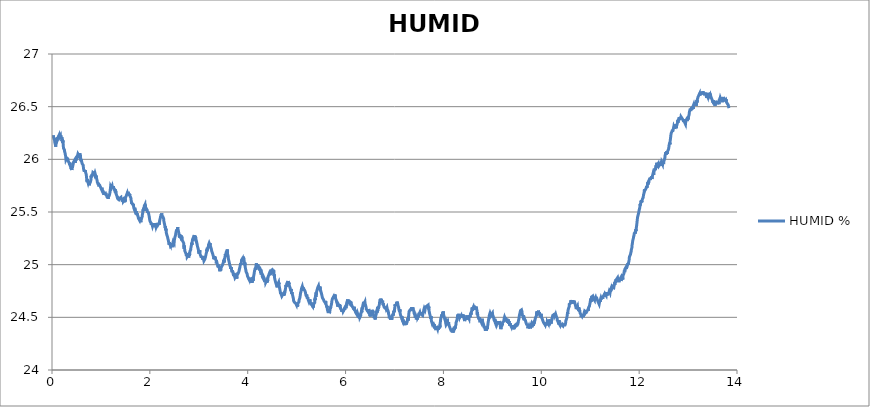
| Category | HUMID % |
|---|---|
| 0.01620481575 | 26.204 |
| 0.019264157416666667 | 26.204 |
| 0.022323499055555557 | 26.211 |
| 0.025382562916666667 | 26.211 |
| 0.028442737944444445 | 26.227 |
| 0.03150207961111111 | 26.211 |
| 0.03456142125 | 26.204 |
| 0.03762076291666666 | 26.204 |
| 0.040680104555555555 | 26.204 |
| 0.04373944622222222 | 26.204 |
| 0.04679878786111111 | 26.188 |
| 0.04985785172222222 | 26.204 |
| 0.05291747116666667 | 26.196 |
| 0.055977090611111106 | 26.173 |
| 0.05903643225 | 26.158 |
| 0.062096329500000005 | 26.158 |
| 0.0651553933611111 | 26.158 |
| 0.0682155683888889 | 26.158 |
| 0.07127546561111112 | 26.135 |
| 0.07433452947222222 | 26.12 |
| 0.07739387113888889 | 26.135 |
| 0.08045349058333334 | 26.135 |
| 0.08351283222222222 | 26.143 |
| 0.0865721738888889 | 26.15 |
| 0.08963123775 | 26.158 |
| 0.09269085719444445 | 26.15 |
| 0.09575019883333334 | 26.166 |
| 0.09880926269444444 | 26.158 |
| 0.10186999330555556 | 26.181 |
| 0.10492933497222222 | 26.181 |
| 0.10798839880555555 | 26.188 |
| 0.11104774047222221 | 26.181 |
| 0.11410735991666666 | 26.196 |
| 0.11716781274999999 | 26.211 |
| 0.12022715438888888 | 26.204 |
| 0.12328677383333334 | 26.196 |
| 0.12634611547222221 | 26.211 |
| 0.12940545713888887 | 26.204 |
| 0.132464521 | 26.204 |
| 0.13552441822222222 | 26.204 |
| 0.13858375988888888 | 26.211 |
| 0.1416431015277778 | 26.227 |
| 0.14470244319444445 | 26.211 |
| 0.14776178483333335 | 26.211 |
| 0.15082112649999999 | 26.227 |
| 0.15388157930555554 | 26.211 |
| 0.15694064316666667 | 26.219 |
| 0.15999998483333333 | 26.211 |
| 0.1630604376388889 | 26.204 |
| 0.16611977930555558 | 26.204 |
| 0.16917884316666668 | 26.219 |
| 0.17223790700000002 | 26.227 |
| 0.17529752644444443 | 26.211 |
| 0.1783568681111111 | 26.227 |
| 0.18141593197222222 | 26.227 |
| 0.18447527361111113 | 26.211 |
| 0.18753461527777776 | 26.211 |
| 0.1905936791111111 | 26.211 |
| 0.19365274297222224 | 26.204 |
| 0.19671264022222223 | 26.196 |
| 0.19977198186111111 | 26.211 |
| 0.20283104572222224 | 26.211 |
| 0.20589010958333334 | 26.173 |
| 0.20894945125 | 26.188 |
| 0.21200934847222222 | 26.181 |
| 0.21506924572222222 | 26.181 |
| 0.21812969852777778 | 26.158 |
| 0.22118904019444444 | 26.181 |
| 0.22424865963888888 | 26.166 |
| 0.22730800127777778 | 26.15 |
| 0.23036706513888888 | 26.127 |
| 0.23342696238888888 | 26.127 |
| 0.2364863040277778 | 26.104 |
| 0.2395453678888889 | 26.104 |
| 0.24260498733333333 | 26.097 |
| 0.2456643289722222 | 26.097 |
| 0.2487236706388889 | 26.097 |
| 0.2517830122777778 | 26.104 |
| 0.2548429095277778 | 26.089 |
| 0.25790225116666665 | 26.074 |
| 0.2609618706111111 | 26.074 |
| 0.2640209344722222 | 26.074 |
| 0.2670802761388889 | 26.059 |
| 0.27013934 | 26.059 |
| 0.2731992372222222 | 26.043 |
| 0.2762583010833333 | 26.043 |
| 0.27931792052777776 | 26.028 |
| 0.2823772621666667 | 26.013 |
| 0.2854374372222222 | 25.998 |
| 0.2884970566666667 | 26.005 |
| 0.2915566761111111 | 26.005 |
| 0.29461657333333335 | 25.998 |
| 0.2976756371944444 | 25.998 |
| 0.30073497883333333 | 26.013 |
| 0.3037940426944445 | 26.005 |
| 0.3068533843611111 | 26.013 |
| 0.309912726 | 26.005 |
| 0.31297429 | 26.005 |
| 0.31604002091666666 | 26.013 |
| 0.3190996403611111 | 26.005 |
| 0.3221592598055556 | 26.005 |
| 0.32521887925 | 25.998 |
| 0.3282796098611111 | 25.99 |
| 0.3313403404722222 | 25.99 |
| 0.33440023772222227 | 25.998 |
| 0.3374601349722222 | 25.998 |
| 0.34052086558333333 | 25.975 |
| 0.34358131841666667 | 25.982 |
| 0.3466417712222222 | 25.975 |
| 0.3497011128888889 | 25.967 |
| 0.3527632324722222 | 25.967 |
| 0.3558228519166667 | 25.967 |
| 0.35888330475 | 25.96 |
| 0.36194570211111116 | 25.944 |
| 0.36501421097222225 | 25.967 |
| 0.36807605275 | 25.96 |
| 0.37114261705555557 | 25.952 |
| 0.3742025142777778 | 25.937 |
| 0.3772626893055555 | 25.937 |
| 0.38032453111111114 | 25.937 |
| 0.3833844283333333 | 25.929 |
| 0.38644543675 | 25.921 |
| 0.38950700075 | 25.914 |
| 0.3925688425555556 | 25.906 |
| 0.39562985097222225 | 25.921 |
| 0.3986961374722222 | 25.921 |
| 0.40175603469444443 | 25.914 |
| 0.40481593194444443 | 25.898 |
| 0.4078777737222222 | 25.914 |
| 0.41093878213888885 | 25.914 |
| 0.4139986793888889 | 25.937 |
| 0.41705913219444446 | 25.921 |
| 0.42011875163888884 | 25.929 |
| 0.42317809330555556 | 25.937 |
| 0.42623743494444444 | 25.944 |
| 0.4292970543888889 | 25.944 |
| 0.4323566738333333 | 25.929 |
| 0.43541712666666665 | 25.96 |
| 0.43847674611111115 | 25.96 |
| 0.4415388656944444 | 25.975 |
| 0.4445984851388889 | 25.967 |
| 0.44765782680555555 | 25.967 |
| 0.4507188352222222 | 25.975 |
| 0.45378539949999996 | 25.975 |
| 0.4568447411388889 | 25.975 |
| 0.4599040828055555 | 25.99 |
| 0.46296370225 | 25.967 |
| 0.46602415505555556 | 25.982 |
| 0.4690837745 | 25.982 |
| 0.4721433939722222 | 25.975 |
| 0.4752024578055556 | 25.967 |
| 0.4782617994722222 | 25.982 |
| 0.48132225230555553 | 25.982 |
| 0.48438187175 | 25.975 |
| 0.48744093558333335 | 26.005 |
| 0.4905005550277778 | 25.99 |
| 0.49355989669444444 | 25.998 |
| 0.49661896055555554 | 25.998 |
| 0.4996791355833333 | 26.013 |
| 0.5027387550277778 | 25.998 |
| 0.5057980966666666 | 26.013 |
| 0.5088577161111111 | 26.013 |
| 0.5119170577777777 | 26.028 |
| 0.5149763994166666 | 26.013 |
| 0.5180357410833333 | 26.028 |
| 0.5210950827222223 | 26.028 |
| 0.5241549799722222 | 26.028 |
| 0.5272143216111111 | 26.028 |
| 0.5302736632777778 | 26.051 |
| 0.5333330049166667 | 26.051 |
| 0.5363920687777778 | 26.059 |
| 0.5394514104166667 | 26.059 |
| 0.5425110298611111 | 26.059 |
| 0.5455706493055555 | 26.059 |
| 0.5486299909722222 | 26.036 |
| 0.5516904437777778 | 26.036 |
| 0.5547497854444444 | 26.059 |
| 0.5578096826666666 | 26.043 |
| 0.5608693021111111 | 26.043 |
| 0.5639291993611111 | 26.043 |
| 0.5669888188055555 | 26.036 |
| 0.5700489938333333 | 26.036 |
| 0.5731083355 | 26.036 |
| 0.5761676771388888 | 26.051 |
| 0.5792275743888889 | 26.043 |
| 0.5822869160277778 | 26.036 |
| 0.5853487578333333 | 26.013 |
| 0.5884086550555556 | 26.013 |
| 0.5914679967222223 | 26.005 |
| 0.5945273383611112 | 25.982 |
| 0.5975869578055555 | 25.998 |
| 0.60064657725 | 25.99 |
| 0.6037061966944445 | 25.982 |
| 0.6067652605555556 | 25.975 |
| 0.60982488 | 25.99 |
| 0.6128842216388889 | 25.975 |
| 0.6159438410833333 | 25.96 |
| 0.6190029049444444 | 25.967 |
| 0.6220628021944444 | 25.967 |
| 0.6251221438333333 | 25.967 |
| 0.6281820410833333 | 25.967 |
| 0.6312411049444444 | 25.96 |
| 0.634300724388889 | 25.967 |
| 0.6373608994166666 | 25.944 |
| 0.6404199632777777 | 25.937 |
| 0.6434793049166666 | 25.914 |
| 0.6465386465833333 | 25.906 |
| 0.6495990993888889 | 25.898 |
| 0.6526584410555555 | 25.906 |
| 0.6557175049166666 | 25.898 |
| 0.6587768465555556 | 25.906 |
| 0.6618359104166667 | 25.883 |
| 0.6648949742777778 | 25.898 |
| 0.6679545937222223 | 25.891 |
| 0.6710139353611111 | 25.883 |
| 0.6740732770277779 | 25.883 |
| 0.6771323408888889 | 25.883 |
| 0.6801922381111111 | 25.898 |
| 0.6832515797777777 | 25.883 |
| 0.6863109214166666 | 25.883 |
| 0.6893699852777778 | 25.876 |
| 0.6924296047222221 | 25.868 |
| 0.6954892241666667 | 25.868 |
| 0.6985499547777778 | 25.876 |
| 0.7016106854166666 | 25.853 |
| 0.7046700270555555 | 25.83 |
| 0.7077302020833333 | 25.837 |
| 0.7107903771111111 | 25.815 |
| 0.7138497187777778 | 25.807 |
| 0.7169090604166667 | 25.792 |
| 0.7199684020833333 | 25.807 |
| 0.7230277437222222 | 25.784 |
| 0.7260868075833333 | 25.807 |
| 0.7291461492222222 | 25.792 |
| 0.7322060464722222 | 25.792 |
| 0.7352651103333334 | 25.792 |
| 0.7383244519722223 | 25.776 |
| 0.741383793638889 | 25.769 |
| 0.7444439686666667 | 25.784 |
| 0.7475030325277777 | 25.792 |
| 0.7505623741666667 | 25.784 |
| 0.7536222714166667 | 25.784 |
| 0.756681890861111 | 25.769 |
| 0.7597412324999999 | 25.769 |
| 0.7628005741666666 | 25.754 |
| 0.765859638 | 25.754 |
| 0.7689189796666668 | 25.769 |
| 0.7719780435277778 | 25.776 |
| 0.7750371073888889 | 25.769 |
| 0.7780964490277777 | 25.761 |
| 0.7811560684722223 | 25.776 |
| 0.7842151323333333 | 25.784 |
| 0.7872805854444445 | 25.792 |
| 0.7903402048888889 | 25.784 |
| 0.7934001021111111 | 25.792 |
| 0.7964627773055555 | 25.807 |
| 0.7995229523333333 | 25.845 |
| 0.8025836829444445 | 25.837 |
| 0.8056483026944444 | 25.83 |
| 0.8087073665277777 | 25.83 |
| 0.8117678193611111 | 25.837 |
| 0.8148282721944444 | 25.845 |
| 0.8179112263055556 | 25.837 |
| 0.8210047365833334 | 25.86 |
| 0.8240715786666667 | 25.845 |
| 0.8271378651388889 | 25.853 |
| 0.8302341533611111 | 25.86 |
| 0.8332948839722222 | 25.853 |
| 0.8363586703333333 | 25.876 |
| 0.8394296793055556 | 25.868 |
| 0.8424995771111111 | 25.876 |
| 0.8455630856666667 | 25.876 |
| 0.8486377059722222 | 25.868 |
| 0.8517070481944444 | 25.876 |
| 0.8547772238055555 | 25.876 |
| 0.8578462882222223 | 25.868 |
| 0.8609147970833333 | 25.876 |
| 0.8639855282777777 | 25.86 |
| 0.8670629264999999 | 25.868 |
| 0.8701283796111111 | 25.853 |
| 0.8731957772777778 | 25.86 |
| 0.8762559523055555 | 25.86 |
| 0.8793405731944444 | 25.868 |
| 0.882412971138889 | 25.868 |
| 0.8854831467500001 | 25.86 |
| 0.888550266611111 | 25.853 |
| 0.8916207200277778 | 25.86 |
| 0.89468533975 | 25.86 |
| 0.8977502372777778 | 25.83 |
| 0.9008168015555555 | 25.845 |
| 0.9038803101111111 | 25.845 |
| 0.9069743759722222 | 25.83 |
| 0.9100401068888888 | 25.837 |
| 0.9131016708888888 | 25.815 |
| 0.9161707353055556 | 25.807 |
| 0.9192364662222222 | 25.815 |
| 0.9223096975555556 | 25.799 |
| 0.9253823733055555 | 25.784 |
| 0.92844671525 | 25.776 |
| 0.9315141129166666 | 25.792 |
| 0.9346031784722223 | 25.784 |
| 0.93768391025 | 25.784 |
| 0.9407485299722222 | 25.784 |
| 0.9438209279166666 | 25.784 |
| 0.9468924925 | 25.761 |
| 0.9499568344444445 | 25.776 |
| 0.9530231209166666 | 25.754 |
| 0.9560907963888889 | 25.761 |
| 0.9591590274444444 | 25.754 |
| 0.9622339255277779 | 25.761 |
| 0.9653029899722223 | 25.754 |
| 0.9683670541111111 | 25.754 |
| 0.9714330628055556 | 25.754 |
| 0.9744946268055557 | 25.754 |
| 0.9775598021111112 | 25.754 |
| 0.9806277553888889 | 25.746 |
| 0.9836982087777778 | 25.746 |
| 0.9867617173333334 | 25.746 |
| 0.9898296705833333 | 25.738 |
| 0.9929040130833333 | 25.731 |
| 0.9959686328333333 | 25.738 |
| 0.9990457532777778 | 25.731 |
| 1.0021114841666665 | 25.738 |
| 1.0051797152222222 | 25.738 |
| 1.0082732255 | 25.731 |
| 1.0113453456666666 | 25.715 |
| 1.0144141323055555 | 25.715 |
| 1.017506531388889 | 25.715 |
| 1.0205739290555556 | 25.731 |
| 1.0236579943333333 | 25.715 |
| 1.02672372525 | 25.715 |
| 1.029811401861111 | 25.715 |
| 1.032892967 | 25.708 |
| 1.0359750877222222 | 25.708 |
| 1.0390497080277779 | 25.715 |
| 1.0421309953888889 | 25.7 |
| 1.0452078380277778 | 25.708 |
| 1.0482696798333333 | 25.692 |
| 1.0513426333611111 | 25.685 |
| 1.0544441996666667 | 25.685 |
| 1.05753659875 | 25.677 |
| 1.0606017740833333 | 25.662 |
| 1.0636813946666666 | 25.662 |
| 1.0667543481944444 | 25.67 |
| 1.0698203569166667 | 25.677 |
| 1.072900810861111 | 25.677 |
| 1.0759909876111111 | 25.685 |
| 1.079068385861111 | 25.677 |
| 1.0821452285 | 25.692 |
| 1.0852242935 | 25.685 |
| 1.0883314156666666 | 25.662 |
| 1.0913993689166668 | 25.677 |
| 1.0944737114444445 | 25.662 |
| 1.0975466649722223 | 25.677 |
| 1.1006465645 | 25.67 |
| 1.1037395191944444 | 25.67 |
| 1.1068299737222222 | 25.677 |
| 1.1099054274166666 | 25.662 |
| 1.1130056047222223 | 25.67 |
| 1.1160841141388889 | 25.662 |
| 1.1191570676944445 | 25.654 |
| 1.1222719680833333 | 25.647 |
| 1.1253426992777777 | 25.654 |
| 1.1284198197222222 | 25.647 |
| 1.1314986069166666 | 25.647 |
| 1.1345998954166667 | 25.639 |
| 1.1376775714444445 | 25.647 |
| 1.1407677481944445 | 25.647 |
| 1.143864592 | 25.647 |
| 1.1469633803333332 | 25.624 |
| 1.150034667111111 | 25.639 |
| 1.1530981756666667 | 25.639 |
| 1.1561677956944443 | 25.639 |
| 1.1592404714444446 | 25.631 |
| 1.1623070357222223 | 25.631 |
| 1.1653749889722222 | 25.647 |
| 1.1684454423888888 | 25.654 |
| 1.17151728475 | 25.662 |
| 1.1745807933055554 | 25.662 |
| 1.1776495799444446 | 25.67 |
| 1.1807283671388888 | 25.662 |
| 1.183796876 | 25.685 |
| 1.1868745520277777 | 25.692 |
| 1.1899419496944446 | 25.708 |
| 1.1930087917777779 | 25.7 |
| 1.1960803563333333 | 25.731 |
| 1.199141086972222 | 25.746 |
| 1.2022040399166667 | 25.738 |
| 1.2052689374444445 | 25.738 |
| 1.2083402242222223 | 25.738 |
| 1.2114126221944443 | 25.738 |
| 1.2144758529444446 | 25.738 |
| 1.2175410282777777 | 25.731 |
| 1.2206195376666666 | 25.731 |
| 1.2236849907777776 | 25.738 |
| 1.226747110388889 | 25.738 |
| 1.2298114523055557 | 25.746 |
| 1.2328738496944445 | 25.746 |
| 1.2359351359166666 | 25.731 |
| 1.2390130897222222 | 25.746 |
| 1.2420793762222222 | 25.738 |
| 1.2451409402222222 | 25.731 |
| 1.2482086156944443 | 25.746 |
| 1.25127212425 | 25.731 |
| 1.2543372995555557 | 25.746 |
| 1.2574005303333333 | 25.731 |
| 1.2604654278333334 | 25.738 |
| 1.2635375480000002 | 25.731 |
| 1.2666024455277778 | 25.738 |
| 1.2696676208333333 | 25.723 |
| 1.2727280736666666 | 25.738 |
| 1.27579491575 | 25.723 |
| 1.2788553685833333 | 25.715 |
| 1.2819174881666666 | 25.708 |
| 1.2849804411388888 | 25.723 |
| 1.2880447830833333 | 25.7 |
| 1.2911080138333333 | 25.715 |
| 1.2941693000277776 | 25.685 |
| 1.297237808888889 | 25.685 |
| 1.3002988173055554 | 25.677 |
| 1.3033606590833333 | 25.7 |
| 1.3064227786666667 | 25.677 |
| 1.3094862872222222 | 25.67 |
| 1.3125764639722222 | 25.67 |
| 1.315646917388889 | 25.67 |
| 1.3187112593055557 | 25.662 |
| 1.3217733789166666 | 25.654 |
| 1.3248496659722224 | 25.654 |
| 1.3279128967222222 | 25.654 |
| 1.3309814055833333 | 25.647 |
| 1.334059081611111 | 25.654 |
| 1.3371187010555556 | 25.631 |
| 1.34018470975 | 25.647 |
| 1.34324627375 | 25.647 |
| 1.3463556182499998 | 25.624 |
| 1.3494169044722222 | 25.631 |
| 1.3524768016944444 | 25.631 |
| 1.35555447775 | 25.616 |
| 1.358627986861111 | 25.624 |
| 1.3617020515833331 | 25.624 |
| 1.3647708382222221 | 25.616 |
| 1.3678396248611113 | 25.616 |
| 1.370907578111111 | 25.624 |
| 1.373972475638889 | 25.624 |
| 1.3770398733055558 | 25.624 |
| 1.38009949275 | 25.609 |
| 1.3831646680555556 | 25.616 |
| 1.3862278988333332 | 25.631 |
| 1.3892891850277778 | 25.631 |
| 1.392348804472222 | 25.624 |
| 1.395409812888889 | 25.631 |
| 1.39852137975 | 25.624 |
| 1.4015904441666667 | 25.624 |
| 1.4046672868333334 | 25.639 |
| 1.4077335733333334 | 25.639 |
| 1.4108006931944443 | 25.631 |
| 1.41386420175 | 25.616 |
| 1.4169260435555555 | 25.609 |
| 1.419986496361111 | 25.624 |
| 1.4230477825833332 | 25.631 |
| 1.4261240696388888 | 25.624 |
| 1.4291925784722221 | 25.616 |
| 1.432258864972222 | 25.624 |
| 1.4353254292777777 | 25.624 |
| 1.4383958826666667 | 25.616 |
| 1.4414757810555556 | 25.624 |
| 1.4445415119444445 | 25.624 |
| 1.447609743 | 25.624 |
| 1.450673807138889 | 25.624 |
| 1.4537331488055556 | 25.616 |
| 1.4567994352777778 | 25.601 |
| 1.45986238825 | 25.609 |
| 1.462932008277778 | 25.609 |
| 1.4659946834444446 | 25.609 |
| 1.4690679147777779 | 25.601 |
| 1.4721311455555555 | 25.609 |
| 1.4751918761666667 | 25.609 |
| 1.4782526067777777 | 25.616 |
| 1.4813763965555555 | 25.601 |
| 1.4844396273333333 | 25.616 |
| 1.4875009135277777 | 25.593 |
| 1.4905641443055555 | 25.616 |
| 1.4936376534166667 | 25.601 |
| 1.4967033843333333 | 25.609 |
| 1.499776337861111 | 25.631 |
| 1.5028492914166665 | 25.639 |
| 1.505911411 | 25.631 |
| 1.5089813088055555 | 25.639 |
| 1.5120500954444445 | 25.647 |
| 1.5151147151666666 | 25.647 |
| 1.51817683475 | 25.647 |
| 1.5212372875833333 | 25.654 |
| 1.5242988515833333 | 25.662 |
| 1.5273584710277777 | 25.67 |
| 1.5304194794444446 | 25.654 |
| 1.5334807656388887 | 25.662 |
| 1.5365401073055556 | 25.677 |
| 1.5396027824722223 | 25.677 |
| 1.5426624019166666 | 25.662 |
| 1.5457264660555554 | 25.677 |
| 1.5487919191666666 | 25.685 |
| 1.5518590390555556 | 25.685 |
| 1.5549247699444444 | 25.692 |
| 1.5579846671944446 | 25.677 |
| 1.5610467867777778 | 25.67 |
| 1.5641205736944443 | 25.685 |
| 1.5671824155 | 25.685 |
| 1.5702423127222223 | 25.685 |
| 1.5733049879166667 | 25.67 |
| 1.5763643295555554 | 25.677 |
| 1.5794250601666666 | 25.67 |
| 1.5824849574166668 | 25.654 |
| 1.5855451324444445 | 25.662 |
| 1.588609474388889 | 25.67 |
| 1.5916727051388888 | 25.654 |
| 1.5947353803333333 | 25.662 |
| 1.5977974999166669 | 25.654 |
| 1.6008579527500002 | 25.647 |
| 1.6039203501111112 | 25.654 |
| 1.6069816363333334 | 25.662 |
| 1.610041811361111 | 25.647 |
| 1.6131008752222222 | 25.631 |
| 1.616163550388889 | 25.616 |
| 1.6192253921944444 | 25.616 |
| 1.6222955677777777 | 25.601 |
| 1.6253549094444444 | 25.586 |
| 1.6284303631111112 | 25.593 |
| 1.6314899825555556 | 25.593 |
| 1.6345507131944443 | 25.578 |
| 1.6376106104166666 | 25.578 |
| 1.6406707854444444 | 25.578 |
| 1.643730127111111 | 25.586 |
| 1.6467903021388888 | 25.578 |
| 1.6498529773055555 | 25.57 |
| 1.6529128745555555 | 25.563 |
| 1.6559774942777776 | 25.57 |
| 1.65904044725 | 25.57 |
| 1.6621000666944443 | 25.578 |
| 1.6651688533333333 | 25.563 |
| 1.6682365288055556 | 25.563 |
| 1.6713150382222224 | 25.54 |
| 1.6743749354444446 | 25.532 |
| 1.6774356660555554 | 25.54 |
| 1.6804950077222223 | 25.532 |
| 1.6835546271666666 | 25.525 |
| 1.6866184135 | 25.525 |
| 1.6896847 | 25.54 |
| 1.69274459725 | 25.54 |
| 1.6958050500555555 | 25.532 |
| 1.6988666140555557 | 25.54 |
| 1.7019287336666666 | 25.532 |
| 1.7049889086944445 | 25.509 |
| 1.7080493615277779 | 25.509 |
| 1.7111089809722222 | 25.502 |
| 1.714177212 | 25.502 |
| 1.7172376648333334 | 25.502 |
| 1.7202972842777777 | 25.487 |
| 1.723358570472222 | 25.509 |
| 1.7264223568333334 | 25.487 |
| 1.7294839208333332 | 25.494 |
| 1.7325443736666666 | 25.479 |
| 1.7356037153055557 | 25.471 |
| 1.7386691684166666 | 25.479 |
| 1.7417326769722223 | 25.487 |
| 1.7447934076111111 | 25.487 |
| 1.7478541382222224 | 25.471 |
| 1.75091431325 | 25.471 |
| 1.7539739326944443 | 25.471 |
| 1.757035218888889 | 25.464 |
| 1.7600948383333332 | 25.456 |
| 1.763155013388889 | 25.456 |
| 1.766217132972222 | 25.441 |
| 1.7692825860833332 | 25.448 |
| 1.7723613732777777 | 25.441 |
| 1.7754207149444445 | 25.448 |
| 1.7784833901111112 | 25.448 |
| 1.78154745425 | 25.448 |
| 1.7846098516388889 | 25.425 |
| 1.7876769715 | 25.433 |
| 1.7907413134444445 | 25.448 |
| 1.7938050998055557 | 25.433 |
| 1.7968841648055556 | 25.441 |
| 1.7999443398333335 | 25.433 |
| 1.8030042370555557 | 25.441 |
| 1.8060644121111111 | 25.433 |
| 1.8091287540277778 | 25.425 |
| 1.8122169862222222 | 25.425 |
| 1.815276327888889 | 25.403 |
| 1.8183365029166667 | 25.418 |
| 1.82139695575 | 25.425 |
| 1.8244587975277777 | 25.425 |
| 1.8275203615277777 | 25.433 |
| 1.8305805365555554 | 25.433 |
| 1.8336418227777778 | 25.433 |
| 1.8367042201388888 | 25.433 |
| 1.8397696732500002 | 25.441 |
| 1.8428331818055554 | 25.456 |
| 1.8458947458055557 | 25.471 |
| 1.8489554764444445 | 25.471 |
| 1.8520273188055556 | 25.479 |
| 1.855118884527778 | 25.494 |
| 1.8581798929444444 | 25.502 |
| 1.861240067972222 | 25.525 |
| 1.8643007985833333 | 25.525 |
| 1.8673623625833333 | 25.509 |
| 1.8704247599722224 | 25.525 |
| 1.8734918798333333 | 25.54 |
| 1.8765512215 | 25.517 |
| 1.879620008138889 | 25.532 |
| 1.8826857390277778 | 25.54 |
| 1.8857459140555557 | 25.555 |
| 1.888810256 | 25.563 |
| 1.8918704310277779 | 25.548 |
| 1.894933384 | 25.555 |
| 1.898012449 | 25.555 |
| 1.901074846388889 | 25.57 |
| 1.9041358548055556 | 25.555 |
| 1.9071982521666668 | 25.57 |
| 1.9102603717777777 | 25.555 |
| 1.913319991222222 | 25.555 |
| 1.9163879444722223 | 25.548 |
| 1.9194481195000002 | 25.532 |
| 1.92250801675 | 25.509 |
| 1.9255712475 | 25.532 |
| 1.9286333670833333 | 25.532 |
| 1.9316988201944443 | 25.525 |
| 1.934759828611111 | 25.525 |
| 1.937819725861111 | 25.532 |
| 1.9408860123333334 | 25.525 |
| 1.9439459095833334 | 25.525 |
| 1.9470099737222222 | 25.517 |
| 1.9500743156666667 | 25.502 |
| 1.9531350462777777 | 25.502 |
| 1.956195776888889 | 25.509 |
| 1.9592559519444444 | 25.502 |
| 1.962317793722222 | 25.494 |
| 1.9653790799444444 | 25.502 |
| 1.9684392549722223 | 25.494 |
| 1.97149943 | 25.494 |
| 1.9745584938611112 | 25.494 |
| 1.9776236691666669 | 25.479 |
| 1.9806843997777777 | 25.471 |
| 1.9837442970277779 | 25.471 |
| 1.9868041942777779 | 25.456 |
| 1.9898732586944445 | 25.448 |
| 1.9929409341666666 | 25.441 |
| 1.9960005536111112 | 25.425 |
| 1.9990648955277779 | 25.425 |
| 2.002144516138889 | 25.425 |
| 2.0052060801388887 | 25.41 |
| 2.008267644138889 | 25.41 |
| 2.0113289303333333 | 25.41 |
| 2.0143893831666664 | 25.403 |
| 2.0174495581944445 | 25.41 |
| 2.0205094554444445 | 25.41 |
| 2.0235685192777777 | 25.395 |
| 2.0266411950277776 | 25.387 |
| 2.0297088705 | 25.38 |
| 2.0327690455277776 | 25.38 |
| 2.0358292205555557 | 25.395 |
| 2.0388941180833333 | 25.395 |
| 2.0419554043055554 | 25.395 |
| 2.0450155793333336 | 25.38 |
| 2.048078810083333 | 25.372 |
| 2.0511398185 | 25.372 |
| 2.0542008269166665 | 25.364 |
| 2.05726127975 | 25.372 |
| 2.0603245105 | 25.364 |
| 2.0633994085833334 | 25.372 |
| 2.066459028027778 | 25.372 |
| 2.069520869833333 | 25.387 |
| 2.0725807670833336 | 25.372 |
| 2.0756417755 | 25.38 |
| 2.0787013949444444 | 25.364 |
| 2.0817757374444446 | 25.38 |
| 2.084835079083333 | 25.387 |
| 2.0878991432222223 | 25.357 |
| 2.0909598738611113 | 25.38 |
| 2.0940203266666666 | 25.395 |
| 2.0970796683333335 | 25.364 |
| 2.1001448436388888 | 25.372 |
| 2.103211963527778 | 25.38 |
| 2.1062874171944443 | 25.372 |
| 2.1093475922500002 | 25.38 |
| 2.1124066560833334 | 25.38 |
| 2.1154671089166666 | 25.357 |
| 2.1185381179166667 | 25.349 |
| 2.121608849083333 | 25.372 |
| 2.124671246472222 | 25.364 |
| 2.1277330882777776 | 25.357 |
| 2.1308018749166666 | 25.357 |
| 2.133861494361111 | 25.357 |
| 2.1369241695277776 | 25.357 |
| 2.1399865669166664 | 25.372 |
| 2.1430464641388887 | 25.372 |
| 2.1461077503611112 | 25.38 |
| 2.1491698699444446 | 25.395 |
| 2.1522392121666667 | 25.38 |
| 2.1552988316111112 | 25.372 |
| 2.158363729138889 | 25.395 |
| 2.161423070777778 | 25.387 |
| 2.1644824124444444 | 25.403 |
| 2.1675417540833335 | 25.38 |
| 2.17060109575 | 25.38 |
| 2.1736640486944445 | 25.372 |
| 2.1767356132777778 | 25.38 |
| 2.1797946771388887 | 25.38 |
| 2.182861519222222 | 25.387 |
| 2.1859219720555556 | 25.395 |
| 2.1889868695555554 | 25.38 |
| 2.1920492669444442 | 25.38 |
| 2.1951108309444445 | 25.395 |
| 2.198171005972222 | 25.403 |
| 2.201230069833333 | 25.403 |
| 2.2042955229444443 | 25.425 |
| 2.2073562535555555 | 25.433 |
| 2.2104178175555553 | 25.433 |
| 2.213478270388889 | 25.433 |
| 2.216538167638889 | 25.448 |
| 2.219602231777778 | 25.448 |
| 2.222669351638889 | 25.448 |
| 2.2257311934444446 | 25.464 |
| 2.2287916462777777 | 25.448 |
| 2.2318604329166667 | 25.456 |
| 2.2349253304166665 | 25.479 |
| 2.237988283388889 | 25.464 |
| 2.2410590145833336 | 25.487 |
| 2.2441236343333335 | 25.464 |
| 2.2471874206666667 | 25.464 |
| 2.250250095833333 | 25.456 |
| 2.2533113820555557 | 25.464 |
| 2.2563935027777777 | 25.464 |
| 2.2594531222222223 | 25.464 |
| 2.262512741666667 | 25.456 |
| 2.2655765280277778 | 25.456 |
| 2.2686414255555554 | 25.464 |
| 2.2717021561666666 | 25.456 |
| 2.274765664722222 | 25.456 |
| 2.277826117555555 | 25.448 |
| 2.2808943485833333 | 25.456 |
| 2.2839534124444447 | 25.433 |
| 2.2870133096944443 | 25.41 |
| 2.2900918191111113 | 25.41 |
| 2.293151994138889 | 25.403 |
| 2.2962121691666666 | 25.418 |
| 2.299273733166667 | 25.418 |
| 2.3023350193888885 | 25.38 |
| 2.305397138972222 | 25.372 |
| 2.308457314 | 25.38 |
| 2.311521933722222 | 25.38 |
| 2.3145846088888886 | 25.349 |
| 2.3176467285 | 25.364 |
| 2.320706625722222 | 25.349 |
| 2.323765967388889 | 25.326 |
| 2.326838920916667 | 25.342 |
| 2.3299004849166667 | 25.342 |
| 2.3329812166944444 | 25.326 |
| 2.3360458364166665 | 25.303 |
| 2.339108789388889 | 25.311 |
| 2.3421681310277775 | 25.296 |
| 2.3452271948888885 | 25.296 |
| 2.348287647722222 | 25.281 |
| 2.3513536564166664 | 25.288 |
| 2.3544163315833333 | 25.288 |
| 2.3574792845555557 | 25.273 |
| 2.360538626222222 | 25.265 |
| 2.363599634611111 | 25.265 |
| 2.3666606430277777 | 25.25 |
| 2.369723318222222 | 25.25 |
| 2.372783215444444 | 25.25 |
| 2.3758425571111115 | 25.235 |
| 2.3789024543333337 | 25.227 |
| 2.381962073777778 | 25.219 |
| 2.385026137916667 | 25.219 |
| 2.3880935355833333 | 25.212 |
| 2.391153155027778 | 25.204 |
| 2.3942133300833333 | 25.189 |
| 2.3972735051111114 | 25.197 |
| 2.4003334023333336 | 25.212 |
| 2.4033963553055555 | 25.197 |
| 2.406459308277778 | 25.197 |
| 2.409520594472222 | 25.189 |
| 2.412581880694445 | 25.197 |
| 2.4156490005555558 | 25.189 |
| 2.4187138980833334 | 25.204 |
| 2.4217768510555557 | 25.181 |
| 2.4248398040277777 | 25.204 |
| 2.4279216469722225 | 25.174 |
| 2.4309871000833336 | 25.166 |
| 2.434053664361111 | 25.174 |
| 2.4371141171944446 | 25.174 |
| 2.4401745700277777 | 25.174 |
| 2.44323446725 | 25.174 |
| 2.4462965868333333 | 25.174 |
| 2.4493567618611114 | 25.181 |
| 2.452416659111111 | 25.174 |
| 2.455481556638889 | 25.174 |
| 2.4585458985833335 | 25.174 |
| 2.4616049624166667 | 25.166 |
| 2.464685138611111 | 25.197 |
| 2.467746424805555 | 25.204 |
| 2.4708088221944444 | 25.204 |
| 2.4738681638333335 | 25.204 |
| 2.47692917225 | 25.219 |
| 2.479991291833333 | 25.219 |
| 2.4830581339166664 | 25.227 |
| 2.486118031166667 | 25.212 |
| 2.4891829286944445 | 25.212 |
| 2.4922422703333336 | 25.219 |
| 2.4953018897777777 | 25.204 |
| 2.498364287166667 | 25.227 |
| 2.5014277957222224 | 25.235 |
| 2.5044874151666665 | 25.227 |
| 2.507558146361111 | 25.235 |
| 2.5106222105000002 | 25.258 |
| 2.5136826633333333 | 25.25 |
| 2.5167464496666665 | 25.258 |
| 2.519819125416667 | 25.258 |
| 2.5228793004444445 | 25.265 |
| 2.5259411422499998 | 25.265 |
| 2.529001872861111 | 25.288 |
| 2.5320639924444444 | 25.303 |
| 2.5351247230833334 | 25.311 |
| 2.5381907317777777 | 25.303 |
| 2.5412500734166668 | 25.296 |
| 2.5443135819722222 | 25.326 |
| 2.547373757 | 25.326 |
| 2.5504369877777777 | 25.334 |
| 2.5534979961944444 | 25.326 |
| 2.5565581712222225 | 25.326 |
| 2.559621679777778 | 25.319 |
| 2.5626835215833332 | 25.326 |
| 2.565745363361111 | 25.334 |
| 2.5688083163333335 | 25.357 |
| 2.5718687691666666 | 25.342 |
| 2.574928666388889 | 25.334 |
| 2.5779902303888886 | 25.334 |
| 2.581052627777778 | 25.326 |
| 2.584111969416667 | 25.326 |
| 2.587173255638889 | 25.311 |
| 2.5902350974166666 | 25.303 |
| 2.593294439083333 | 25.296 |
| 2.5963573920555554 | 25.303 |
| 2.5994175670833335 | 25.296 |
| 2.6024780199166666 | 25.296 |
| 2.6055404172777776 | 25.258 |
| 2.608600314527778 | 25.288 |
| 2.6116635452777777 | 25.265 |
| 2.6147309429444445 | 25.281 |
| 2.617792229166667 | 25.273 |
| 2.6208579600555555 | 25.273 |
| 2.6239242465555557 | 25.273 |
| 2.626987477333333 | 25.265 |
| 2.6300473745555553 | 25.273 |
| 2.633107827388889 | 25.273 |
| 2.636168002416667 | 25.281 |
| 2.6392351223055552 | 25.25 |
| 2.6422961306944446 | 25.265 |
| 2.6453663063055557 | 25.265 |
| 2.648430092666667 | 25.25 |
| 2.6514911010833333 | 25.265 |
| 2.6545554429999996 | 25.258 |
| 2.65761534025 | 25.235 |
| 2.660674404111111 | 25.242 |
| 2.6637370792777775 | 25.242 |
| 2.6667972543055556 | 25.227 |
| 2.6698574293333333 | 25.242 |
| 2.6729173265833333 | 25.227 |
| 2.6759813907222223 | 25.219 |
| 2.679042676944445 | 25.219 |
| 2.682102574166667 | 25.212 |
| 2.6851688606666664 | 25.212 |
| 2.6882357027499997 | 25.212 |
| 2.691296988944444 | 25.204 |
| 2.6943577195833335 | 25.181 |
| 2.6974228948888888 | 25.166 |
| 2.700486125638889 | 25.151 |
| 2.7035457450833333 | 25.181 |
| 2.7066075868888886 | 25.166 |
| 2.709669150888889 | 25.158 |
| 2.712737104138889 | 25.166 |
| 2.7157995015277776 | 25.128 |
| 2.7188591209722226 | 25.136 |
| 2.7219240184999998 | 25.136 |
| 2.7249933607222223 | 25.128 |
| 2.7280554803055557 | 25.12 |
| 2.7311178776944445 | 25.113 |
| 2.734183886388889 | 25.113 |
| 2.7372443392222223 | 25.113 |
| 2.7403114590833337 | 25.105 |
| 2.7433744120555557 | 25.097 |
| 2.746450699111111 | 25.082 |
| 2.7495136520833334 | 25.105 |
| 2.752575771666667 | 25.082 |
| 2.7556381690555556 | 25.105 |
| 2.7587025109999996 | 25.09 |
| 2.761772964388889 | 25.075 |
| 2.7648325838333334 | 25.067 |
| 2.767893314444444 | 25.075 |
| 2.7709537672777778 | 25.082 |
| 2.7740150535 | 25.075 |
| 2.7770788398333335 | 25.082 |
| 2.780139014861111 | 25.075 |
| 2.783202801222222 | 25.09 |
| 2.7862649208055554 | 25.082 |
| 2.78932454025 | 25.082 |
| 2.7923872154166665 | 25.067 |
| 2.795449057222222 | 25.082 |
| 2.7985172882777776 | 25.082 |
| 2.8015791300555555 | 25.082 |
| 2.804646805527778 | 25.097 |
| 2.8077069805555555 | 25.097 |
| 2.8107702113055555 | 25.082 |
| 2.8138301085555555 | 25.097 |
| 2.8168900058055555 | 25.105 |
| 2.8199532365555555 | 25.128 |
| 2.8230511915277776 | 25.128 |
| 2.826115533472222 | 25.128 |
| 2.8291754306944443 | 25.136 |
| 2.832235050138889 | 25.136 |
| 2.8352988365 | 25.143 |
| 2.838358178138889 | 25.158 |
| 2.8414211311111113 | 25.158 |
| 2.844484361888889 | 25.166 |
| 2.8475573154166662 | 25.181 |
| 2.8506191572222224 | 25.189 |
| 2.853681832388889 | 25.189 |
| 2.8567556193055554 | 25.204 |
| 2.859816627722222 | 25.189 |
| 2.862887358916667 | 25.212 |
| 2.865948089527778 | 25.204 |
| 2.869008542361111 | 25.219 |
| 2.872068717388889 | 25.212 |
| 2.875130836972222 | 25.242 |
| 2.878191012 | 25.227 |
| 2.8812550761666667 | 25.25 |
| 2.8843188625 | 25.242 |
| 2.88737875975 | 25.242 |
| 2.8904522688611114 | 25.258 |
| 2.893512166111111 | 25.258 |
| 2.896572896722222 | 25.265 |
| 2.899634738527778 | 25.273 |
| 2.9027035251666664 | 25.265 |
| 2.9057673115 | 25.273 |
| 2.908830820055556 | 25.281 |
| 2.9118982177222223 | 25.258 |
| 2.9149642264166666 | 25.265 |
| 2.918025790416667 | 25.258 |
| 2.9210898545833333 | 25.258 |
| 2.9241533631388887 | 25.265 |
| 2.927241873111111 | 25.242 |
| 2.930330383111111 | 25.25 |
| 2.933400003111111 | 25.273 |
| 2.936462122694444 | 25.258 |
| 2.9395225755277776 | 25.265 |
| 2.942585806305556 | 25.25 |
| 2.945646259111111 | 25.235 |
| 2.9487106010555553 | 25.242 |
| 2.951780498861111 | 25.235 |
| 2.9548423406666666 | 25.235 |
| 2.9579091827500004 | 25.212 |
| 2.9609715801111114 | 25.204 |
| 2.9640334219166666 | 25.204 |
| 2.967097208277778 | 25.189 |
| 2.9701565499166667 | 25.189 |
| 2.9732195028888886 | 25.174 |
| 2.976280789083333 | 25.181 |
| 2.979340964111111 | 25.166 |
| 2.9824114175277776 | 25.158 |
| 2.985472148138889 | 25.166 |
| 2.9885331565555555 | 25.151 |
| 2.9915936093888886 | 25.166 |
| 2.99465434 | 25.136 |
| 2.997715904 | 25.136 |
| 3.0007771901944444 | 25.12 |
| 3.0038390319999997 | 25.136 |
| 3.006912541138889 | 25.105 |
| 3.0099729939444444 | 25.136 |
| 3.01306511525 | 25.128 |
| 3.016126401472222 | 25.12 |
| 3.0191957436944445 | 25.136 |
| 3.022257029888889 | 25.12 |
| 3.0253180383055556 | 25.113 |
| 3.0283812690555556 | 25.097 |
| 3.0314714458055554 | 25.097 |
| 3.034538010111111 | 25.09 |
| 3.0375970739722225 | 25.09 |
| 3.0406589157500004 | 25.082 |
| 3.043722702111111 | 25.075 |
| 3.046788155222222 | 25.09 |
| 3.0498502748055554 | 25.082 |
| 3.0529096164444445 | 25.067 |
| 3.055970069277778 | 25.082 |
| 3.059034689 | 25.075 |
| 3.0620979197777776 | 25.067 |
| 3.065157539222222 | 25.082 |
| 3.0682213255555557 | 25.075 |
| 3.0712826117777774 | 25.067 |
| 3.0743425089999996 | 25.067 |
| 3.0774051841944443 | 25.067 |
| 3.080468970527778 | 25.052 |
| 3.0835285899722225 | 25.052 |
| 3.0865904317777777 | 25.067 |
| 3.0896522735833334 | 25.044 |
| 3.0927118930277775 | 25.052 |
| 3.095778457305556 | 25.075 |
| 3.09883807675 | 25.052 |
| 3.1019024186944444 | 25.052 |
| 3.1049631493055556 | 25.036 |
| 3.1080244355 | 25.044 |
| 3.111088499638889 | 25.044 |
| 3.1141970107777777 | 25.036 |
| 3.1172574636111112 | 25.044 |
| 3.1203256946666666 | 25.044 |
| 3.123385591888889 | 25.052 |
| 3.126452433972222 | 25.052 |
| 3.1295173315 | 25.052 |
| 3.1325872293055554 | 25.067 |
| 3.135647126555556 | 25.067 |
| 3.1387173021388888 | 25.075 |
| 3.1417769215833333 | 25.075 |
| 3.144836541027778 | 25.09 |
| 3.147896993861111 | 25.082 |
| 3.1509566133055555 | 25.105 |
| 3.1540203996666665 | 25.105 |
| 3.1570811302777777 | 25.105 |
| 3.160141305305556 | 25.12 |
| 3.1632059250555553 | 25.143 |
| 3.1662672112499997 | 25.128 |
| 3.1693387758333333 | 25.136 |
| 3.172400062027778 | 25.136 |
| 3.1754649595555557 | 25.158 |
| 3.1785262457499996 | 25.143 |
| 3.181586143 | 25.158 |
| 3.1846482625833334 | 25.166 |
| 3.1877081598333334 | 25.166 |
| 3.190768612638889 | 25.166 |
| 3.1938343435555554 | 25.166 |
| 3.196922020166667 | 25.174 |
| 3.1999835841666666 | 25.189 |
| 3.203043203611111 | 25.197 |
| 3.206103378638889 | 25.189 |
| 3.209166609388889 | 25.189 |
| 3.212227340027778 | 25.204 |
| 3.2152902930000002 | 25.204 |
| 3.218351857 | 25.212 |
| 3.221413143194445 | 25.197 |
| 3.224473318222222 | 25.189 |
| 3.2275326598888885 | 25.197 |
| 3.23059505725 | 25.204 |
| 3.233660510361111 | 25.189 |
| 3.2367234633333335 | 25.181 |
| 3.2397850273333333 | 25.174 |
| 3.2428479803055557 | 25.174 |
| 3.245908710916667 | 25.174 |
| 3.2489736084444445 | 25.174 |
| 3.2520390615555557 | 25.166 |
| 3.255098403222222 | 25.151 |
| 3.258159411638889 | 25.143 |
| 3.261224031361111 | 25.151 |
| 3.264283650805556 | 25.128 |
| 3.2673541041944443 | 25.136 |
| 3.2704156681944445 | 25.136 |
| 3.2734752876388886 | 25.136 |
| 3.2765354626666667 | 25.113 |
| 3.2796006380000002 | 25.113 |
| 3.2826627575833336 | 25.105 |
| 3.285725710555556 | 25.12 |
| 3.2887911636666662 | 25.105 |
| 3.2918505053055553 | 25.09 |
| 3.294910958138889 | 25.097 |
| 3.29797168875 | 25.082 |
| 3.3010338083333335 | 25.075 |
| 3.304093983388889 | 25.067 |
| 3.3071544361944447 | 25.075 |
| 3.310218222555555 | 25.052 |
| 3.313277842 | 25.067 |
| 3.3163369058611107 | 25.075 |
| 3.31940735925 | 25.075 |
| 3.3224708678055555 | 25.067 |
| 3.3255321540277776 | 25.082 |
| 3.32859205125 | 25.067 |
| 3.331660282305555 | 25.059 |
| 3.3347204573333333 | 25.052 |
| 3.3377842436944447 | 25.059 |
| 3.340844974305556 | 25.067 |
| 3.3439065383055553 | 25.052 |
| 3.3469675467222224 | 25.059 |
| 3.3500274439444446 | 25.059 |
| 3.353092063694444 | 25.052 |
| 3.3561516831388887 | 25.036 |
| 3.3592149138888887 | 25.013 |
| 3.3622753667222223 | 25.044 |
| 3.3653372085 | 25.029 |
| 3.368404328388889 | 25.021 |
| 3.3714656145833337 | 25.021 |
| 3.3745269008055554 | 25.021 |
| 3.3775904093611113 | 25.006 |
| 3.3806500288055554 | 25.006 |
| 3.383715481916667 | 25.006 |
| 3.3867753791388893 | 24.998 |
| 3.389838332111111 | 24.998 |
| 3.392898507138889 | 25.013 |
| 3.395959793361111 | 25.006 |
| 3.399019968388889 | 24.975 |
| 3.402081532388889 | 24.998 |
| 3.405140874027778 | 24.991 |
| 3.408200771277778 | 24.991 |
| 3.411271502472222 | 24.998 |
| 3.414330844111111 | 24.975 |
| 3.4173932415 | 24.975 |
| 3.4204528609444442 | 24.983 |
| 3.4235119248055557 | 24.96 |
| 3.426574322194444 | 24.945 |
| 3.4296411642777773 | 24.968 |
| 3.4327030060555557 | 24.952 |
| 3.435762347722222 | 24.937 |
| 3.438821689361111 | 24.96 |
| 3.441881586611111 | 24.975 |
| 3.44494565075 | 24.96 |
| 3.4480113816388887 | 24.945 |
| 3.4510732234444443 | 24.968 |
| 3.4541331206944443 | 24.968 |
| 3.457193295722222 | 24.968 |
| 3.460254304138889 | 24.968 |
| 3.4633150347500004 | 24.968 |
| 3.4663763209444443 | 24.975 |
| 3.46943816275 | 24.983 |
| 3.4725011157222223 | 24.991 |
| 3.4755612907500004 | 24.975 |
| 3.478621187972222 | 24.983 |
| 3.481682196388889 | 24.983 |
| 3.4847451493611112 | 24.998 |
| 3.48780588 | 24.991 |
| 3.490865221638889 | 24.998 |
| 3.493926230055555 | 24.991 |
| 3.4969880718333335 | 25.013 |
| 3.5000532471666665 | 25.006 |
| 3.5031137 | 25.006 |
| 3.5061758195833335 | 25.021 |
| 3.5092365501944442 | 25.021 |
| 3.5122978363888886 | 25.044 |
| 3.5153605115833333 | 25.036 |
| 3.518420964388889 | 25.021 |
| 3.521493362361111 | 25.052 |
| 3.524552981805556 | 25.044 |
| 3.52761260125 | 25.044 |
| 3.5306802766944445 | 25.044 |
| 3.5337429518888888 | 25.067 |
| 3.536806182638889 | 25.059 |
| 3.5398688578055553 | 25.075 |
| 3.542930699611111 | 25.097 |
| 3.545995041555556 | 25.075 |
| 3.549056049972222 | 25.097 |
| 3.552117058388889 | 25.105 |
| 3.555179177972222 | 25.097 |
| 3.558240186388889 | 25.113 |
| 3.5613003614166665 | 25.105 |
| 3.5643602586388887 | 25.12 |
| 3.567426545138889 | 25.128 |
| 3.5704861645833335 | 25.113 |
| 3.5735460618333335 | 25.12 |
| 3.5766106815555556 | 25.12 |
| 3.5796708565833333 | 25.097 |
| 3.582734642944444 | 25.143 |
| 3.5857953735555554 | 25.105 |
| 3.588856381972222 | 25.113 |
| 3.5919207239166666 | 25.105 |
| 3.5949797877500003 | 25.09 |
| 3.5980566304166666 | 25.082 |
| 3.601117361027778 | 25.075 |
| 3.604180314 | 25.059 |
| 3.6072399334444447 | 25.052 |
| 3.6103034419999998 | 25.044 |
| 3.613364172611111 | 25.052 |
| 3.6164240698611114 | 25.044 |
| 3.6194836893055555 | 25.029 |
| 3.622544697722222 | 25.029 |
| 3.6256070951111115 | 25.021 |
| 3.6286678257222222 | 25.006 |
| 3.6317296674999997 | 25.006 |
| 3.634789009166667 | 25.013 |
| 3.6378483508055552 | 24.991 |
| 3.6409082480555557 | 24.991 |
| 3.6439678675 | 24.983 |
| 3.647029987083333 | 24.983 |
| 3.6500904399166667 | 24.975 |
| 3.653156448611111 | 24.968 |
| 3.65622523525 | 24.96 |
| 3.6592848546944445 | 24.975 |
| 3.6623447519166668 | 24.96 |
| 3.66540520475 | 24.975 |
| 3.6684651020000003 | 24.952 |
| 3.671524999222222 | 24.945 |
| 3.6745846186666666 | 24.945 |
| 3.677643960333333 | 24.945 |
| 3.6807102468055555 | 24.93 |
| 3.683772088611111 | 24.922 |
| 3.686834486 | 24.937 |
| 3.68989605 | 24.945 |
| 3.6929562250277774 | 24.93 |
| 3.6960155666666665 | 24.93 |
| 3.699076297305556 | 24.922 |
| 3.70213591675 | 24.914 |
| 3.7052013698611113 | 24.914 |
| 3.7082607115 | 24.907 |
| 3.711321442111111 | 24.891 |
| 3.7143827283333333 | 24.922 |
| 3.7174470702777778 | 24.914 |
| 3.720507245305556 | 24.907 |
| 3.723571865027778 | 24.914 |
| 3.726631484472222 | 24.899 |
| 3.7296958264166666 | 24.891 |
| 3.732756557027778 | 24.884 |
| 3.73581784325 | 24.884 |
| 3.7388780182777777 | 24.876 |
| 3.74194430475 | 24.884 |
| 3.7450053131666667 | 24.869 |
| 3.7480924341944446 | 24.884 |
| 3.7511520536388887 | 24.876 |
| 3.75421584 | 24.869 |
| 3.7572865711666665 | 24.891 |
| 3.760347024 | 24.891 |
| 3.763411921527778 | 24.876 |
| 3.766472652138889 | 24.876 |
| 3.7695358829166667 | 24.876 |
| 3.7725977246944447 | 24.891 |
| 3.7756615110555556 | 24.869 |
| 3.7787244640277775 | 24.891 |
| 3.781786583611111 | 24.891 |
| 3.784848147611111 | 24.891 |
| 3.7879138785277777 | 24.899 |
| 3.790974609138889 | 24.907 |
| 3.794037284305556 | 24.899 |
| 3.797099126111111 | 24.907 |
| 3.8001773577222226 | 24.907 |
| 3.8032369771666668 | 24.899 |
| 3.80629909675 | 24.907 |
| 3.8093598273888887 | 24.922 |
| 3.812419724611111 | 24.93 |
| 3.8154790662777778 | 24.93 |
| 3.8185400746666662 | 24.93 |
| 3.8216005275 | 24.937 |
| 3.8246598691666667 | 24.93 |
| 3.827727544611111 | 24.952 |
| 3.83081855475 | 24.945 |
| 3.833889563722222 | 24.945 |
| 3.8369494609722223 | 24.952 |
| 3.8400096359999996 | 24.975 |
| 3.8430756446944447 | 24.968 |
| 3.8461444313333333 | 24.983 |
| 3.8492059953333335 | 24.998 |
| 3.8522672815555556 | 24.991 |
| 3.855342735222222 | 25.013 |
| 3.8584040214444446 | 25.006 |
| 3.861464196472222 | 25.013 |
| 3.864523538111111 | 24.998 |
| 3.8675839909444445 | 25.013 |
| 3.870644999361111 | 25.021 |
| 3.873705729972222 | 25.044 |
| 3.876765627222222 | 25.036 |
| 3.8798285801666665 | 25.052 |
| 3.8828887552222224 | 25.052 |
| 3.885950597 | 25.044 |
| 3.8890141055555554 | 25.044 |
| 3.8920748361944444 | 25.044 |
| 3.895134455638889 | 25.059 |
| 3.898197408583333 | 25.044 |
| 3.9012598059722223 | 25.052 |
| 3.904328592611111 | 25.036 |
| 3.9073946013055556 | 25.059 |
| 3.9104578320833334 | 25.075 |
| 3.9135196738611113 | 25.067 |
| 3.916586238166667 | 25.082 |
| 3.9196466909722223 | 25.067 |
| 3.922707699388889 | 25.052 |
| 3.9257673188333335 | 25.052 |
| 3.928829438416667 | 25.052 |
| 3.931899336222222 | 25.021 |
| 3.9349589556666666 | 25.013 |
| 3.9380202418888888 | 24.998 |
| 3.941084306027778 | 25.021 |
| 3.9441447588611114 | 24.991 |
| 3.9472093785833335 | 24.991 |
| 3.950273442722222 | 24.983 |
| 3.953334173361111 | 24.983 |
| 3.9563960151388886 | 24.983 |
| 3.959458412527778 | 24.952 |
| 3.9625213655000002 | 24.952 |
| 3.9655954301944445 | 24.945 |
| 3.968659216555556 | 24.93 |
| 3.971730781138889 | 24.93 |
| 3.9747906783611113 | 24.922 |
| 3.9778502978055554 | 24.937 |
| 3.980910195055556 | 24.922 |
| 3.983970092277778 | 24.93 |
| 3.9870361009999997 | 24.914 |
| 3.990102387472222 | 24.907 |
| 3.993170340722222 | 24.914 |
| 3.9962327381111113 | 24.891 |
| 3.9992945799166666 | 24.891 |
| 4.002361144194444 | 24.891 |
| 4.005422152611112 | 24.884 |
| 4.008481494250001 | 24.884 |
| 4.011541113694444 | 24.876 |
| 4.014607955777778 | 24.876 |
| 4.01767090875 | 24.869 |
| 4.0207344173055555 | 24.876 |
| 4.0237943145555555 | 24.876 |
| 4.026860878833333 | 24.861 |
| 4.029927998722222 | 24.876 |
| 4.032989284916667 | 24.861 |
| 4.036050015527778 | 24.853 |
| 4.039112135111111 | 24.861 |
| 4.042172587944445 | 24.869 |
| 4.045232207388889 | 24.853 |
| 4.0482915490555555 | 24.869 |
| 4.051354502000001 | 24.861 |
| 4.05441439925 | 24.853 |
| 4.05747596325 | 24.846 |
| 4.0605355826944445 | 24.853 |
| 4.063619925777778 | 24.838 |
| 4.066679545222222 | 24.853 |
| 4.06973972025 | 24.846 |
| 4.072799061916666 | 24.846 |
| 4.075863681638889 | 24.846 |
| 4.078925801222222 | 24.83 |
| 4.082001254916666 | 24.838 |
| 4.085068930361111 | 24.846 |
| 4.088132716722222 | 24.838 |
| 4.091193447333334 | 24.83 |
| 4.094259456027777 | 24.846 |
| 4.097321853416667 | 24.838 |
| 4.100388973277777 | 24.846 |
| 4.103451092888889 | 24.846 |
| 4.106526546555556 | 24.884 |
| 4.1095939442222225 | 24.846 |
| 4.112659397333333 | 24.869 |
| 4.115730406333333 | 24.869 |
| 4.118794470472222 | 24.869 |
| 4.121854367694445 | 24.869 |
| 4.124913431555556 | 24.899 |
| 4.127977495722222 | 24.899 |
| 4.13103767075 | 24.907 |
| 4.134102568277778 | 24.922 |
| 4.137162187722222 | 24.937 |
| 4.140225418472222 | 24.937 |
| 4.143287815861111 | 24.945 |
| 4.146348824277778 | 24.937 |
| 4.149415388555555 | 24.937 |
| 4.1524780637222225 | 24.945 |
| 4.155540738888889 | 24.968 |
| 4.15860452525 | 24.968 |
| 4.161664700277777 | 24.952 |
| 4.164750987916666 | 24.975 |
| 4.16781144075 | 24.975 |
| 4.170872449166667 | 24.983 |
| 4.173934846527778 | 24.983 |
| 4.17699613275 | 25.013 |
| 4.180058807916667 | 24.983 |
| 4.183126205583333 | 25.006 |
| 4.186186658416667 | 24.991 |
| 4.189246277861111 | 24.998 |
| 4.192306730694445 | 25.006 |
| 4.195366072333333 | 24.998 |
| 4.198430136472222 | 24.983 |
| 4.2014997565000005 | 24.975 |
| 4.204565765194444 | 24.975 |
| 4.207629551555556 | 24.998 |
| 4.210689171 | 24.983 |
| 4.2137490682222225 | 24.975 |
| 4.216816743694444 | 24.975 |
| 4.2198771965277775 | 24.983 |
| 4.222939593888889 | 24.975 |
| 4.22599865775 | 24.983 |
| 4.2290582771944445 | 24.968 |
| 4.232119841194444 | 24.983 |
| 4.235185572111111 | 24.952 |
| 4.238246024916666 | 24.975 |
| 4.241305644361111 | 24.968 |
| 4.244365263805555 | 24.952 |
| 4.2474407175 | 24.952 |
| 4.250501170333333 | 24.952 |
| 4.253564956666667 | 24.945 |
| 4.256625965083333 | 24.952 |
| 4.259685862333334 | 24.952 |
| 4.262747981916667 | 24.937 |
| 4.265810934888889 | 24.952 |
| 4.268870276527777 | 24.922 |
| 4.271932118333334 | 24.93 |
| 4.274999516 | 24.907 |
| 4.2780610800000005 | 24.907 |
| 4.2811245885555556 | 24.914 |
| 4.284186430361111 | 24.922 |
| 4.287253828027778 | 24.93 |
| 4.290319281138888 | 24.922 |
| 4.293379456166667 | 24.907 |
| 4.296444075888889 | 24.907 |
| 4.299509251194444 | 24.884 |
| 4.302568870666667 | 24.884 |
| 4.305639601833334 | 24.876 |
| 4.308699776888889 | 24.884 |
| 4.3117655077777775 | 24.876 |
| 4.314828182944445 | 24.884 |
| 4.317896414 | 24.869 |
| 4.32095631125 | 24.876 |
| 4.324016764055556 | 24.884 |
| 4.327081661583334 | 24.876 |
| 4.330143503388888 | 24.884 |
| 4.333205900777778 | 24.876 |
| 4.336268575944445 | 24.876 |
| 4.33933041775 | 24.869 |
| 4.342390037194445 | 24.876 |
| 4.345452712361111 | 24.869 |
| 4.3485262214722225 | 24.838 |
| 4.351588341083334 | 24.861 |
| 4.354648238305556 | 24.853 |
| 4.35771258025 | 24.853 |
| 4.360775811 | 24.861 |
| 4.3638365416388885 | 24.846 |
| 4.3668989389999995 | 24.83 |
| 4.369961891972222 | 24.83 |
| 4.373027345083333 | 24.838 |
| 4.376086964527778 | 24.838 |
| 4.379148528527778 | 24.83 |
| 4.382208147972222 | 24.846 |
| 4.3852686008055555 | 24.83 |
| 4.388329609222222 | 24.846 |
| 4.391395340138889 | 24.838 |
| 4.3944577375 | 24.83 |
| 4.397522635027777 | 24.83 |
| 4.400588921527778 | 24.853 |
| 4.4036518745 | 24.838 |
| 4.4067214945 | 24.838 |
| 4.4097836140833335 | 24.853 |
| 4.412845733694445 | 24.876 |
| 4.41591729825 | 24.876 |
| 4.418976639916667 | 24.884 |
| 4.422037370527778 | 24.891 |
| 4.425097267777778 | 24.884 |
| 4.428156887222222 | 24.884 |
| 4.431216228861111 | 24.884 |
| 4.434279459611111 | 24.899 |
| 4.4373385234722225 | 24.899 |
| 4.440399809694445 | 24.914 |
| 4.443462207055556 | 24.907 |
| 4.446523771055555 | 24.907 |
| 4.4495833905 | 24.899 |
| 4.45264328775 | 24.914 |
| 4.455704018361111 | 24.914 |
| 4.458763915611112 | 24.922 |
| 4.461826035194445 | 24.922 |
| 4.464885376861111 | 24.93 |
| 4.467945829666666 | 24.907 |
| 4.471008227055555 | 24.914 |
| 4.474069235472222 | 24.937 |
| 4.4771294105 | 24.922 |
| 4.480190418916666 | 24.945 |
| 4.483250038361111 | 24.937 |
| 4.486310213388889 | 24.952 |
| 4.489372055194444 | 24.952 |
| 4.492433896972222 | 24.952 |
| 4.495494349805556 | 24.945 |
| 4.498559247333334 | 24.952 |
| 4.5016222003055555 | 24.952 |
| 4.504687931194445 | 24.952 |
| 4.507752828722222 | 24.952 |
| 4.5108132815555555 | 24.945 |
| 4.513878734666666 | 24.945 |
| 4.5169402986666665 | 24.937 |
| 4.5200043628055555 | 24.937 |
| 4.523065093416666 | 24.93 |
| 4.5261277686111105 | 24.93 |
| 4.529188499222222 | 24.952 |
| 4.532247840861111 | 24.914 |
| 4.535309127083333 | 24.914 |
| 4.538370413277778 | 24.907 |
| 4.5414305883055555 | 24.891 |
| 4.544494096861111 | 24.907 |
| 4.547570383944445 | 24.891 |
| 4.550630003388889 | 24.869 |
| 4.553703512499999 | 24.869 |
| 4.556766465472222 | 24.876 |
| 4.559828029472222 | 24.869 |
| 4.562887926722222 | 24.846 |
| 4.565951435277778 | 24.846 |
| 4.569012443694444 | 24.853 |
| 4.572079841361111 | 24.83 |
| 4.575143627694445 | 24.83 |
| 4.578207414055556 | 24.838 |
| 4.581277867444444 | 24.83 |
| 4.584342764972222 | 24.838 |
| 4.587404051194444 | 24.808 |
| 4.59047089325 | 24.808 |
| 4.593530512694445 | 24.808 |
| 4.596593187888889 | 24.815 |
| 4.599656418638888 | 24.815 |
| 4.6027174270555555 | 24.785 |
| 4.605782324583333 | 24.8 |
| 4.608847222111111 | 24.808 |
| 4.6119085083055555 | 24.808 |
| 4.614975072611111 | 24.815 |
| 4.618035247638889 | 24.823 |
| 4.621094867083333 | 24.808 |
| 4.624158931222222 | 24.815 |
| 4.627219939638889 | 24.815 |
| 4.630289837444444 | 24.83 |
| 4.633350845861111 | 24.815 |
| 4.636411298694444 | 24.83 |
| 4.639478696361111 | 24.815 |
| 4.642543038277778 | 24.8 |
| 4.645609324777778 | 24.8 |
| 4.648674222305556 | 24.785 |
| 4.651740786583333 | 24.785 |
| 4.654800683833334 | 24.769 |
| 4.657861970027778 | 24.762 |
| 4.660926034166667 | 24.769 |
| 4.663986487 | 24.762 |
| 4.667048050999999 | 24.739 |
| 4.670107392666667 | 24.746 |
| 4.6731664565 | 24.724 |
| 4.676237187694444 | 24.739 |
| 4.679297640527778 | 24.724 |
| 4.6823617046666675 | 24.724 |
| 4.685423268666667 | 24.716 |
| 4.688482610333334 | 24.716 |
| 4.691545007694445 | 24.708 |
| 4.694607682888889 | 24.708 |
| 4.697670635861112 | 24.701 |
| 4.700730810888889 | 24.716 |
| 4.703792097083333 | 24.724 |
| 4.7068525499166665 | 24.708 |
| 4.709914113916667 | 24.716 |
| 4.712973455555556 | 24.708 |
| 4.716033352805556 | 24.708 |
| 4.7190971391388885 | 24.716 |
| 4.722157314194444 | 24.716 |
| 4.725238879333333 | 24.716 |
| 4.728300721111111 | 24.724 |
| 4.731369785555556 | 24.708 |
| 4.7344341275 | 24.724 |
| 4.737495135888889 | 24.724 |
| 4.740555310944444 | 24.731 |
| 4.7436185416944445 | 24.724 |
| 4.746679272305555 | 24.708 |
| 4.749740558527778 | 24.724 |
| 4.7528049004722215 | 24.731 |
| 4.7558672978333325 | 24.724 |
| 4.758926917277778 | 24.731 |
| 4.761988481277777 | 24.739 |
| 4.765049489694444 | 24.739 |
| 4.768114387222222 | 24.739 |
| 4.771175117833333 | 24.769 |
| 4.774235292861111 | 24.762 |
| 4.777297690249999 | 24.777 |
| 4.780361198805555 | 24.777 |
| 4.783424985166667 | 24.808 |
| 4.78648710475 | 24.792 |
| 4.7895472797777785 | 24.8 |
| 4.792607732611112 | 24.792 |
| 4.795670407777777 | 24.808 |
| 4.798729749444444 | 24.815 |
| 4.801791313444444 | 24.815 |
| 4.80485648875 | 24.808 |
| 4.807926664361111 | 24.83 |
| 4.810988783944444 | 24.815 |
| 4.814053125888889 | 24.83 |
| 4.817116356638889 | 24.823 |
| 4.820179309611111 | 24.83 |
| 4.823255596666667 | 24.846 |
| 4.826323272138889 | 24.815 |
| 4.829392614361112 | 24.838 |
| 4.832451956000001 | 24.846 |
| 4.83552046486111 | 24.838 |
| 4.838611752777778 | 24.815 |
| 4.841675539111111 | 24.83 |
| 4.844736547527778 | 24.815 |
| 4.84779783375 | 24.815 |
| 4.850857175388889 | 24.8 |
| 4.853916517055556 | 24.808 |
| 4.856975858694445 | 24.8 |
| 4.860034922555555 | 24.808 |
| 4.863101209055555 | 24.785 |
| 4.866167773333333 | 24.785 |
| 4.869231281888888 | 24.785 |
| 4.872294790444444 | 24.777 |
| 4.875355521055555 | 24.785 |
| 4.878415973888889 | 24.777 |
| 4.881477260083334 | 24.754 |
| 4.8845368795277775 | 24.762 |
| 4.887598443527778 | 24.769 |
| 4.890660007555556 | 24.746 |
| 4.893719904777778 | 24.739 |
| 4.896780079805556 | 24.739 |
| 4.899846366305556 | 24.724 |
| 4.902908208111111 | 24.739 |
| 4.905967827555556 | 24.731 |
| 4.909028558166667 | 24.724 |
| 4.912089011 | 24.716 |
| 4.915150297194444 | 24.724 |
| 4.918210472222222 | 24.708 |
| 4.92127759211111 | 24.701 |
| 4.9243386005 | 24.701 |
| 4.927398219972223 | 24.701 |
| 4.930459506166667 | 24.708 |
| 4.933519125611111 | 24.678 |
| 4.936578189472223 | 24.678 |
| 4.939639475666667 | 24.655 |
| 4.9427040954166666 | 24.663 |
| 4.94576315925 | 24.647 |
| 4.94882388988889 | 24.647 |
| 4.951887120638889 | 24.655 |
| 4.954948962444444 | 24.647 |
| 4.958011915416667 | 24.647 |
| 4.9610709792500005 | 24.64 |
| 4.9641350434166664 | 24.647 |
| 4.96719882975 | 24.64 |
| 4.970259004777779 | 24.64 |
| 4.973318624222222 | 24.64 |
| 4.976392133361111 | 24.632 |
| 4.979452308388889 | 24.64 |
| 4.982514983555555 | 24.632 |
| 4.985574880805555 | 24.632 |
| 4.9886358892222225 | 24.632 |
| 4.991696619833333 | 24.64 |
| 4.994756794861111 | 24.624 |
| 4.997816136527778 | 24.617 |
| 5.0008763115555555 | 24.617 |
| 5.003937875555555 | 24.632 |
| 5.006997217194444 | 24.617 |
| 5.010057947833333 | 24.609 |
| 5.013125067694444 | 24.609 |
| 5.0161860761111114 | 24.609 |
| 5.019249029083333 | 24.602 |
| 5.022308926305556 | 24.617 |
| 5.025374379416666 | 24.632 |
| 5.028433721083333 | 24.632 |
| 5.031496674055556 | 24.624 |
| 5.0345562935 | 24.632 |
| 5.037621468805555 | 24.632 |
| 5.040681366055556 | 24.64 |
| 5.043740707694445 | 24.632 |
| 5.046800049361111 | 24.647 |
| 5.049860779972222 | 24.663 |
| 5.052920954999999 | 24.655 |
| 5.055986408111111 | 24.663 |
| 5.059052416805556 | 24.67 |
| 5.062116203166667 | 24.67 |
| 5.065176933777778 | 24.685 |
| 5.06823822 | 24.685 |
| 5.071298395027777 | 24.701 |
| 5.07435884786111 | 24.708 |
| 5.077421800805555 | 24.701 |
| 5.080485864972222 | 24.731 |
| 5.083547151166666 | 24.731 |
| 5.086607604 | 24.739 |
| 5.089668334611111 | 24.746 |
| 5.092728231861112 | 24.754 |
| 5.095788129083333 | 24.762 |
| 5.098853582194445 | 24.754 |
| 5.101917924138889 | 24.777 |
| 5.104978099166667 | 24.769 |
| 5.108039107583333 | 24.777 |
| 5.111099838194444 | 24.777 |
| 5.114168624833333 | 24.792 |
| 5.117234911333334 | 24.8 |
| 5.120294252972222 | 24.792 |
| 5.123368039888889 | 24.769 |
| 5.126427659333333 | 24.785 |
| 5.129490056722222 | 24.777 |
| 5.132549398388889 | 24.769 |
| 5.135613184722222 | 24.777 |
| 5.138675026527777 | 24.769 |
| 5.1417379795 | 24.754 |
| 5.144797598944444 | 24.769 |
| 5.147858329555556 | 24.777 |
| 5.150919337972223 | 24.777 |
| 5.153978957416666 | 24.769 |
| 5.157038021277778 | 24.769 |
| 5.160102085416667 | 24.769 |
| 5.1631722610277775 | 24.769 |
| 5.166231602666667 | 24.754 |
| 5.169291222111112 | 24.746 |
| 5.172351397138889 | 24.754 |
| 5.1754126833611105 | 24.746 |
| 5.178484247916666 | 24.739 |
| 5.181550256611112 | 24.739 |
| 5.184612376222223 | 24.724 |
| 5.187671717861112 | 24.716 |
| 5.1907313373055555 | 24.731 |
| 5.193790401166667 | 24.716 |
| 5.196854465305556 | 24.701 |
| 5.199921029583333 | 24.701 |
| 5.202983426972223 | 24.708 |
| 5.206043601999999 | 24.716 |
| 5.209104888222223 | 24.693 |
| 5.212165618833334 | 24.701 |
| 5.21523134975 | 24.693 |
| 5.218291246972222 | 24.678 |
| 5.221351699805556 | 24.685 |
| 5.224412430416667 | 24.693 |
| 5.2274720498611105 | 24.693 |
| 5.230532224888889 | 24.678 |
| 5.233592122138889 | 24.685 |
| 5.236652574972222 | 24.678 |
| 5.239729139833334 | 24.663 |
| 5.242792092777777 | 24.67 |
| 5.245856156944444 | 24.67 |
| 5.24892133225 | 24.663 |
| 5.251982062861111 | 24.647 |
| 5.2550433490833335 | 24.655 |
| 5.2581057464444445 | 24.655 |
| 5.2611650881111105 | 24.655 |
| 5.264232207972222 | 24.647 |
| 5.267292383027778 | 24.647 |
| 5.270352002472222 | 24.67 |
| 5.273412455277778 | 24.663 |
| 5.276471796944445 | 24.647 |
| 5.279531416388888 | 24.647 |
| 5.282592980388889 | 24.655 |
| 5.285662878194445 | 24.647 |
| 5.2887374985 | 24.64 |
| 5.291797951333334 | 24.624 |
| 5.294859515333333 | 24.64 |
| 5.297921912694444 | 24.64 |
| 5.300982643333334 | 24.64 |
| 5.304042540555555 | 24.632 |
| 5.307110216027778 | 24.64 |
| 5.310170946638889 | 24.617 |
| 5.313231955055555 | 24.617 |
| 5.316296297 | 24.617 |
| 5.319355360833333 | 24.617 |
| 5.322414702500001 | 24.624 |
| 5.325475433111111 | 24.617 |
| 5.328539219472223 | 24.609 |
| 5.331600783472222 | 24.602 |
| 5.334660125111111 | 24.609 |
| 5.337720855750001 | 24.617 |
| 5.34078241975 | 24.594 |
| 5.343845928305555 | 24.602 |
| 5.3469138815555555 | 24.624 |
| 5.349983223777778 | 24.624 |
| 5.353043398805555 | 24.624 |
| 5.356118019111111 | 24.624 |
| 5.35918208325 | 24.632 |
| 5.3622514254722216 | 24.624 |
| 5.365317434166666 | 24.632 |
| 5.3683826095 | 24.64 |
| 5.371441951138889 | 24.663 |
| 5.374501292777778 | 24.678 |
| 5.37756091225 | 24.663 |
| 5.380622198444445 | 24.685 |
| 5.383681817888888 | 24.693 |
| 5.386744770861111 | 24.708 |
| 5.389806612638889 | 24.708 |
| 5.392867343277778 | 24.693 |
| 5.3959286294722215 | 24.716 |
| 5.398990193472223 | 24.739 |
| 5.4020503685 | 24.716 |
| 5.4051119325 | 24.739 |
| 5.4081718297500005 | 24.746 |
| 5.411232560361111 | 24.739 |
| 5.414291902027777 | 24.746 |
| 5.41735179925 | 24.746 |
| 5.420412807666667 | 24.746 |
| 5.423479927555555 | 24.769 |
| 5.426540935944444 | 24.769 |
| 5.429603611138889 | 24.769 |
| 5.432663786166667 | 24.785 |
| 5.43572368338889 | 24.792 |
| 5.438785525194445 | 24.792 |
| 5.441847644777778 | 24.792 |
| 5.444908653194444 | 24.785 |
| 5.447969106027777 | 24.8 |
| 5.451029836638889 | 24.792 |
| 5.454091400638889 | 24.785 |
| 5.457155187000001 | 24.777 |
| 5.460214806444444 | 24.777 |
| 5.463274703666667 | 24.785 |
| 5.466335989888889 | 24.777 |
| 5.469395887111111 | 24.785 |
| 5.472467173888889 | 24.769 |
| 5.475529849083333 | 24.769 |
| 5.4785914130833335 | 24.792 |
| 5.481656032805556 | 24.769 |
| 5.4847167634166665 | 24.777 |
| 5.48777721625 | 24.762 |
| 5.490839891416667 | 24.754 |
| 5.493900622055556 | 24.746 |
| 5.496970797638889 | 24.754 |
| 5.500029861500001 | 24.739 |
| 5.503089480944444 | 24.739 |
| 5.5061552118611115 | 24.731 |
| 5.509222331722222 | 24.746 |
| 5.51229195175 | 24.716 |
| 5.5153551825 | 24.708 |
| 5.518416746500001 | 24.716 |
| 5.521483310805555 | 24.716 |
| 5.524543763611111 | 24.716 |
| 5.527603938638888 | 24.685 |
| 5.530663835888889 | 24.685 |
| 5.533725399888889 | 24.685 |
| 5.536785297138889 | 24.685 |
| 5.53985075025 | 24.678 |
| 5.5429153699722225 | 24.678 |
| 5.545983323222222 | 24.67 |
| 5.549049054138889 | 24.67 |
| 5.55211450725 | 24.67 |
| 5.555173848888889 | 24.67 |
| 5.558235690694444 | 24.67 |
| 5.561295587916667 | 24.655 |
| 5.5643568741388885 | 24.655 |
| 5.567421771666667 | 24.655 |
| 5.570481113305555 | 24.655 |
| 5.573541010555556 | 24.647 |
| 5.576600352194445 | 24.647 |
| 5.579659971638889 | 24.647 |
| 5.582720424472222 | 24.64 |
| 5.5857800439166665 | 24.647 |
| 5.588839385555556 | 24.64 |
| 5.591900116194444 | 24.655 |
| 5.594966402666667 | 24.647 |
| 5.598037411666667 | 24.64 |
| 5.601097308888889 | 24.624 |
| 5.604161650833333 | 24.617 |
| 5.607221270277778 | 24.624 |
| 5.610287834555556 | 24.609 |
| 5.613353009888889 | 24.609 |
| 5.616419851972222 | 24.609 |
| 5.619479193611111 | 24.594 |
| 5.622542702166666 | 24.609 |
| 5.625603710583333 | 24.594 |
| 5.628668885888889 | 24.571 |
| 5.631730449888889 | 24.571 |
| 5.634794514055556 | 24.571 |
| 5.637856911416667 | 24.571 |
| 5.6409165308611104 | 24.556 |
| 5.643975872527777 | 24.563 |
| 5.647052437388889 | 24.54 |
| 5.65011705711111 | 24.533 |
| 5.653176398749999 | 24.548 |
| 5.656240185111111 | 24.563 |
| 5.65929952675 | 24.556 |
| 5.662359424 | 24.556 |
| 5.665419876833333 | 24.563 |
| 5.668488107888888 | 24.563 |
| 5.671548005111111 | 24.556 |
| 5.6746106802777785 | 24.563 |
| 5.677672244277778 | 24.556 |
| 5.680731585944445 | 24.563 |
| 5.683796483472222 | 24.579 |
| 5.686858325249999 | 24.586 |
| 5.6899182225 | 24.594 |
| 5.6929775641388884 | 24.579 |
| 5.696037461388889 | 24.602 |
| 5.6990979142222224 | 24.594 |
| 5.702159756 | 24.609 |
| 5.705221875583333 | 24.609 |
| 5.708282328416667 | 24.617 |
| 5.711351392861111 | 24.609 |
| 5.7144112900833335 | 24.632 |
| 5.7174722985 | 24.647 |
| 5.720531640138889 | 24.64 |
| 5.723597926638889 | 24.663 |
| 5.726657268305556 | 24.655 |
| 5.7297174433333335 | 24.655 |
| 5.732777896138889 | 24.678 |
| 5.7358427936666665 | 24.678 |
| 5.7389110247222215 | 24.67 |
| 5.741970921972222 | 24.67 |
| 5.745031097 | 24.685 |
| 5.7481026615555555 | 24.685 |
| 5.751162003222222 | 24.693 |
| 5.754223844999999 | 24.701 |
| 5.7572865201944445 | 24.678 |
| 5.760346973 | 24.701 |
| 5.763406314666667 | 24.708 |
| 5.766470101 | 24.701 |
| 5.769530831638889 | 24.693 |
| 5.772593784611112 | 24.701 |
| 5.775661460055555 | 24.678 |
| 5.778723579638888 | 24.716 |
| 5.781783199083334 | 24.708 |
| 5.784851152361111 | 24.716 |
| 5.787911049583333 | 24.708 |
| 5.790970669027778 | 24.701 |
| 5.794030010694445 | 24.693 |
| 5.797092408055556 | 24.678 |
| 5.800152305305556 | 24.685 |
| 5.803216091666666 | 24.685 |
| 5.806275433305555 | 24.685 |
| 5.8093367195 | 24.663 |
| 5.812402172611112 | 24.655 |
| 5.815463736611111 | 24.647 |
| 5.818524745027778 | 24.647 |
| 5.821590475944444 | 24.655 |
| 5.824649539805556 | 24.647 |
| 5.827711937166667 | 24.64 |
| 5.830772945583334 | 24.64 |
| 5.833833953999999 | 24.64 |
| 5.836895240222223 | 24.617 |
| 5.8399554152499995 | 24.602 |
| 5.843014756888889 | 24.602 |
| 5.846076320888889 | 24.624 |
| 5.849135384749999 | 24.609 |
| 5.852196670972223 | 24.624 |
| 5.85527823611111 | 24.617 |
| 5.8583895251666664 | 24.624 |
| 5.861494424972221 | 24.617 |
| 5.865041572305556 | 24.617 |
| 5.868103691888889 | 24.617 |
| 5.871199146722223 | 24.609 |
| 5.8742645998333325 | 24.624 |
| 5.877326441638889 | 24.602 |
| 5.880390505777777 | 24.617 |
| 5.883451236388889 | 24.617 |
| 5.886515300527778 | 24.617 |
| 5.889579920277777 | 24.617 |
| 5.892641206472222 | 24.602 |
| 5.895702492694444 | 24.594 |
| 5.898774057250001 | 24.586 |
| 5.901842566111111 | 24.594 |
| 5.904904130111111 | 24.586 |
| 5.907971249972222 | 24.579 |
| 5.911033091777778 | 24.579 |
| 5.914097155916667 | 24.571 |
| 5.917157886527778 | 24.579 |
| 5.920250007833333 | 24.556 |
| 5.923311294027777 | 24.556 |
| 5.926372580250001 | 24.571 |
| 5.929435255416666 | 24.556 |
| 5.932495152666667 | 24.571 |
| 5.935556161083333 | 24.563 |
| 5.938646893416666 | 24.571 |
| 5.9417173468055555 | 24.556 |
| 5.944780021972222 | 24.571 |
| 5.9478396414166665 | 24.563 |
| 5.950902872194445 | 24.556 |
| 5.953968880888889 | 24.563 |
| 5.957035167388889 | 24.556 |
| 5.960096453583334 | 24.563 |
| 5.963157462 | 24.548 |
| 5.966216803638889 | 24.563 |
| 5.9692775342777775 | 24.571 |
| 5.972344098555556 | 24.563 |
| 5.975404829166667 | 24.586 |
| 5.978468337722222 | 24.579 |
| 5.981530179527778 | 24.571 |
| 5.984600632916667 | 24.594 |
| 5.987664697055555 | 24.594 |
| 5.990725149888888 | 24.602 |
| 5.993791714166667 | 24.594 |
| 5.996862723166667 | 24.602 |
| 5.999927342888888 | 24.602 |
| 6.00298640675 | 24.594 |
| 6.006046859583333 | 24.609 |
| 6.009110923722222 | 24.586 |
| 6.012194988999999 | 24.602 |
| 6.015262942250001 | 24.609 |
| 6.018324784055555 | 24.624 |
| 6.0213857924722225 | 24.609 |
| 6.024445689694445 | 24.617 |
| 6.027506142527778 | 24.617 |
| 6.030568539916667 | 24.647 |
| 6.0336303816944445 | 24.64 |
| 6.036690001138889 | 24.64 |
| 6.039751009555555 | 24.647 |
| 6.042836463833333 | 24.647 |
| 6.045907472805555 | 24.67 |
| 6.048974037083333 | 24.647 |
| 6.05203337875 | 24.663 |
| 6.055093275972222 | 24.663 |
| 6.058152895416667 | 24.655 |
| 6.061213070472222 | 24.663 |
| 6.064274078861112 | 24.647 |
| 6.067334253916667 | 24.647 |
| 6.070394151138889 | 24.655 |
| 6.073453215 | 24.655 |
| 6.076517834722222 | 24.64 |
| 6.079578565361111 | 24.64 |
| 6.082640684944445 | 24.647 |
| 6.085706138055556 | 24.632 |
| 6.088771035583333 | 24.64 |
| 6.091831766194445 | 24.64 |
| 6.094896663722222 | 24.647 |
| 6.097961005666667 | 24.64 |
| 6.101028125527778 | 24.647 |
| 6.104091356277777 | 24.647 |
| 6.107150697944445 | 24.64 |
| 6.110214484277778 | 24.647 |
| 6.113276881666666 | 24.64 |
| 6.1163428903611115 | 24.64 |
| 6.119403898777778 | 24.624 |
| 6.122511020944445 | 24.632 |
| 6.12558341888889 | 24.624 |
| 6.128643871722223 | 24.617 |
| 6.13170404675 | 24.617 |
| 6.1347767225 | 24.617 |
| 6.137839953277778 | 24.602 |
| 6.140899294916666 | 24.594 |
| 6.143959192166667 | 24.602 |
| 6.147031034527778 | 24.594 |
| 6.150090376166666 | 24.602 |
| 6.153151384583333 | 24.609 |
| 6.156232671944444 | 24.594 |
| 6.159293402555556 | 24.586 |
| 6.1623566333055555 | 24.594 |
| 6.165418752916667 | 24.579 |
| 6.168479205722222 | 24.594 |
| 6.1715388251666665 | 24.594 |
| 6.174599000194444 | 24.602 |
| 6.1776655645 | 24.571 |
| 6.180726572916667 | 24.594 |
| 6.183788970277778 | 24.579 |
| 6.186851089888889 | 24.579 |
| 6.189911542694444 | 24.579 |
| 6.192972273333334 | 24.571 |
| 6.196037448638889 | 24.563 |
| 6.199097623666667 | 24.556 |
| 6.202160854444444 | 24.571 |
| 6.205223529611111 | 24.548 |
| 6.208287593750001 | 24.563 |
| 6.211349435555555 | 24.556 |
| 6.214413221888889 | 24.54 |
| 6.217477841638889 | 24.548 |
| 6.220548572805556 | 24.54 |
| 6.223623193111111 | 24.548 |
| 6.226683368138889 | 24.54 |
| 6.229745209944444 | 24.54 |
| 6.232851498722223 | 24.525 |
| 6.235925007861111 | 24.533 |
| 6.239037130305556 | 24.525 |
| 6.242104250166667 | 24.54 |
| 6.245166091972223 | 24.54 |
| 6.248225433611111 | 24.54 |
| 6.251285886444445 | 24.533 |
| 6.2543468948611105 | 24.533 |
| 6.257411236805556 | 24.518 |
| 6.260473634166667 | 24.525 |
| 6.2635426986111105 | 24.518 |
| 6.266602595833334 | 24.51 |
| 6.269662215277777 | 24.51 |
| 6.272726557222223 | 24.518 |
| 6.275786454472222 | 24.502 |
| 6.278846907277778 | 24.51 |
| 6.281907915694444 | 24.495 |
| 6.2849753133611115 | 24.51 |
| 6.288035488416667 | 24.502 |
| 6.2910951078611115 | 24.518 |
| 6.294157227444445 | 24.502 |
| 6.29721768025 | 24.51 |
| 6.300277855305556 | 24.51 |
| 6.30334080825 | 24.502 |
| 6.306401261083333 | 24.51 |
| 6.309463658472222 | 24.518 |
| 6.3125266114444445 | 24.533 |
| 6.315586230888888 | 24.533 |
| 6.3186541841388895 | 24.525 |
| 6.321715470333333 | 24.533 |
| 6.32477647875 | 24.54 |
| 6.327839153944444 | 24.563 |
| 6.330920996861111 | 24.548 |
| 6.333980338527778 | 24.579 |
| 6.3370446804444445 | 24.571 |
| 6.340107911222223 | 24.594 |
| 6.343172253166666 | 24.579 |
| 6.346233817166667 | 24.586 |
| 6.3492951033611105 | 24.602 |
| 6.352355833972222 | 24.594 |
| 6.355422398277778 | 24.609 |
| 6.358483128888889 | 24.609 |
| 6.36154691525 | 24.602 |
| 6.364615701861111 | 24.64 |
| 6.367679766027778 | 24.624 |
| 6.37075633088889 | 24.632 |
| 6.373816783694445 | 24.647 |
| 6.376878903277778 | 24.64 |
| 6.379942689638889 | 24.632 |
| 6.383006753777777 | 24.64 |
| 6.3860663732222225 | 24.632 |
| 6.389140715722222 | 24.632 |
| 6.392206168861111 | 24.64 |
| 6.395265788305556 | 24.647 |
| 6.398325963333334 | 24.632 |
| 6.401385582777778 | 24.64 |
| 6.404447424555555 | 24.632 |
| 6.407507321805555 | 24.617 |
| 6.4105672190277785 | 24.624 |
| 6.413627394083334 | 24.617 |
| 6.416687291305555 | 24.609 |
| 6.419748299722222 | 24.594 |
| 6.422807919166667 | 24.579 |
| 6.425871427722223 | 24.586 |
| 6.4289310471666665 | 24.579 |
| 6.431995389111111 | 24.586 |
| 6.435057786500001 | 24.586 |
| 6.438122961805556 | 24.586 |
| 6.441184525805555 | 24.571 |
| 6.444254145833333 | 24.563 |
| 6.447337655527778 | 24.571 |
| 6.450399775111111 | 24.579 |
| 6.453461894694445 | 24.556 |
| 6.4565237365 | 24.571 |
| 6.459588634027778 | 24.571 |
| 6.462649920222223 | 24.571 |
| 6.465716762305556 | 24.571 |
| 6.468777215138889 | 24.556 |
| 6.471840723694444 | 24.579 |
| 6.474900065333333 | 24.571 |
| 6.477963296083333 | 24.563 |
| 6.481023193333334 | 24.563 |
| 6.484083368361111 | 24.556 |
| 6.487142987805555 | 24.54 |
| 6.490203996222222 | 24.533 |
| 6.493274171833334 | 24.525 |
| 6.496333235694444 | 24.533 |
| 6.499392577333333 | 24.51 |
| 6.502461363972222 | 24.51 |
| 6.505521261222222 | 24.51 |
| 6.508588103277778 | 24.533 |
| 6.511661334638889 | 24.525 |
| 6.514743177555556 | 24.51 |
| 6.517803630388889 | 24.533 |
| 6.520866305555555 | 24.525 |
| 6.523927036194444 | 24.525 |
| 6.526989433555555 | 24.54 |
| 6.530049053000001 | 24.533 |
| 6.53311283936111 | 24.556 |
| 6.536183848333334 | 24.548 |
| 6.539244856750001 | 24.571 |
| 6.542305031777778 | 24.563 |
| 6.545371318277778 | 24.563 |
| 6.548431493305555 | 24.556 |
| 6.551503057888889 | 24.556 |
| 6.554564066305556 | 24.54 |
| 6.557626463666667 | 24.563 |
| 6.560686360916666 | 24.54 |
| 6.56374681375 | 24.54 |
| 6.566807266583333 | 24.533 |
| 6.5698704973333335 | 24.525 |
| 6.572933172500001 | 24.518 |
| 6.575999181194445 | 24.51 |
| 6.5790632453611115 | 24.502 |
| 6.582123142583333 | 24.51 |
| 6.585187206722222 | 24.495 |
| 6.5882521042499995 | 24.495 |
| 6.591318112944444 | 24.51 |
| 6.594378288 | 24.502 |
| 6.597453463888889 | 24.502 |
| 6.600513083333333 | 24.495 |
| 6.603574369527778 | 24.495 |
| 6.606635100138889 | 24.479 |
| 6.609694997388889 | 24.502 |
| 6.612760728277777 | 24.51 |
| 6.615821181111111 | 24.51 |
| 6.618883856305556 | 24.502 |
| 6.621958476583334 | 24.51 |
| 6.62501781825 | 24.51 |
| 6.628077715472222 | 24.533 |
| 6.631140390666667 | 24.533 |
| 6.634206399361111 | 24.556 |
| 6.6372679633611105 | 24.54 |
| 6.640328416194444 | 24.563 |
| 6.643387757833333 | 24.548 |
| 6.646463211527778 | 24.556 |
| 6.649526442277778 | 24.556 |
| 6.652586061722222 | 24.594 |
| 6.655645403388888 | 24.563 |
| 6.658709745305555 | 24.586 |
| 6.661772142694445 | 24.586 |
| 6.66485315225 | 24.586 |
| 6.667913882861111 | 24.602 |
| 6.670974057916666 | 24.594 |
| 6.674033399555555 | 24.579 |
| 6.677093296805555 | 24.602 |
| 6.680153194027778 | 24.609 |
| 6.683216980388889 | 24.609 |
| 6.686281044527777 | 24.602 |
| 6.68934094175 | 24.617 |
| 6.692408061638889 | 24.632 |
| 6.695478237250001 | 24.632 |
| 6.698538967861111 | 24.655 |
| 6.701601643027778 | 24.655 |
| 6.704662651444445 | 24.647 |
| 6.707726715583334 | 24.663 |
| 6.710788001805556 | 24.67 |
| 6.713850399166667 | 24.64 |
| 6.716910574222222 | 24.663 |
| 6.719971860416667 | 24.678 |
| 6.723032868833333 | 24.685 |
| 6.726093043861112 | 24.67 |
| 6.729157108000001 | 24.655 |
| 6.73222089436111 | 24.67 |
| 6.7352807915833335 | 24.663 |
| 6.738342355583333 | 24.647 |
| 6.741402808416666 | 24.655 |
| 6.744462150083334 | 24.655 |
| 6.747542881833333 | 24.655 |
| 6.750602501277778 | 24.655 |
| 6.753665732027778 | 24.64 |
| 6.756728685000001 | 24.64 |
| 6.759788304444444 | 24.647 |
| 6.762853201972223 | 24.632 |
| 6.765915599361111 | 24.617 |
| 6.7689779967499994 | 24.617 |
| 6.77203956075 | 24.632 |
| 6.775101958111111 | 24.617 |
| 6.77816268875 | 24.609 |
| 6.781222030388889 | 24.609 |
| 6.7842830388055555 | 24.602 |
| 6.787345158388889 | 24.594 |
| 6.7904058890000005 | 24.594 |
| 6.7934652306666665 | 24.594 |
| 6.796539017583333 | 24.602 |
| 6.799599192611111 | 24.602 |
| 6.8026610344166665 | 24.602 |
| 6.805720653861111 | 24.594 |
| 6.808781384472223 | 24.579 |
| 6.8118421150833335 | 24.586 |
| 6.814904512472222 | 24.594 |
| 6.8179677432500005 | 24.579 |
| 6.821030418416667 | 24.594 |
| 6.824098649472223 | 24.586 |
| 6.8271588245 | 24.586 |
| 6.830218999527777 | 24.579 |
| 6.833282785888889 | 24.586 |
| 6.836342127527778 | 24.586 |
| 6.839407580638889 | 24.586 |
| 6.8424680334722225 | 24.586 |
| 6.8455309864444445 | 24.594 |
| 6.848601717611111 | 24.602 |
| 6.8516621704444445 | 24.579 |
| 6.854721512111111 | 24.586 |
| 6.857782242722223 | 24.586 |
| 6.860841306583334 | 24.586 |
| 6.863901203805556 | 24.579 |
| 6.866963045611111 | 24.571 |
| 6.870023220638888 | 24.579 |
| 6.873090618305556 | 24.556 |
| 6.876156071416666 | 24.556 |
| 6.879224858055556 | 24.533 |
| 6.8822858664722215 | 24.54 |
| 6.885351041777779 | 24.533 |
| 6.888411494611112 | 24.518 |
| 6.891476947722222 | 24.502 |
| 6.894538511722223 | 24.495 |
| 6.897598131166667 | 24.51 |
| 6.900658861777777 | 24.51 |
| 6.903718203444444 | 24.495 |
| 6.906777267305555 | 24.502 |
| 6.90983688675 | 24.495 |
| 6.912898172944444 | 24.502 |
| 6.915969737527778 | 24.479 |
| 6.919031023722223 | 24.495 |
| 6.9220942545 | 24.479 |
| 6.925154429527778 | 24.479 |
| 6.92821432675 | 24.495 |
| 6.931273668416666 | 24.479 |
| 6.934339954916667 | 24.495 |
| 6.937402630083333 | 24.479 |
| 6.940463082916666 | 24.495 |
| 6.943523257944444 | 24.479 |
| 6.9465914889722225 | 24.495 |
| 6.949660275611111 | 24.495 |
| 6.952726562111111 | 24.502 |
| 6.9557889595 | 24.518 |
| 6.958848578944444 | 24.525 |
| 6.961911254111111 | 24.51 |
| 6.964970873555556 | 24.51 |
| 6.968030770805555 | 24.525 |
| 6.971093168166666 | 24.533 |
| 6.974153898805556 | 24.518 |
| 6.977217129555555 | 24.51 |
| 6.980293416638888 | 24.533 |
| 6.983355536222222 | 24.548 |
| 6.9864184891944445 | 24.548 |
| 6.989481719944444 | 24.563 |
| 6.992548562027777 | 24.571 |
| 6.9956095704444445 | 24.548 |
| 6.998674467972222 | 24.571 |
| 7.001735754166667 | 24.579 |
| 7.004795651416667 | 24.586 |
| 7.007856104222222 | 24.594 |
| 7.010915723666667 | 24.609 |
| 7.0139770098888885 | 24.624 |
| 7.0170377405 | 24.609 |
| 7.020097082166667 | 24.624 |
| 7.023158646166666 | 24.624 |
| 7.026218265611112 | 24.624 |
| 7.029280107388889 | 24.609 |
| 7.03235194975 | 24.617 |
| 7.0354137915555555 | 24.624 |
| 7.038474244388889 | 24.632 |
| 7.041533308222222 | 24.624 |
| 7.044593483277778 | 24.624 |
| 7.047654491666667 | 24.624 |
| 7.0507149445 | 24.647 |
| 7.053776786305556 | 24.632 |
| 7.0568452951388885 | 24.647 |
| 7.059907136944444 | 24.647 |
| 7.062970367694445 | 24.64 |
| 7.066033876250001 | 24.624 |
| 7.069097384805556 | 24.624 |
| 7.072158115416666 | 24.632 |
| 7.075225235305556 | 24.609 |
| 7.078286243722222 | 24.609 |
| 7.081354196972223 | 24.617 |
| 7.084413260833334 | 24.594 |
| 7.0874731580555554 | 24.579 |
| 7.090533610888889 | 24.579 |
| 7.093599619583333 | 24.586 |
| 7.096659239027778 | 24.571 |
| 7.099723025388888 | 24.571 |
| 7.102785422777778 | 24.556 |
| 7.105849209111111 | 24.563 |
| 7.108909384138888 | 24.579 |
| 7.111968725805555 | 24.548 |
| 7.115028900833333 | 24.54 |
| 7.11808990925 | 24.556 |
| 7.121151473249999 | 24.525 |
| 7.1242113704722225 | 24.525 |
| 7.127271545527778 | 24.518 |
| 7.130364500194444 | 24.525 |
| 7.133429953305555 | 24.51 |
| 7.136489294972222 | 24.502 |
| 7.139550581166667 | 24.502 |
| 7.142609645027778 | 24.502 |
| 7.145669542277778 | 24.495 |
| 7.148738606694445 | 24.502 |
| 7.151804337611111 | 24.502 |
| 7.15486367925 | 24.51 |
| 7.157925243249999 | 24.479 |
| 7.160988474 | 24.472 |
| 7.164048093444444 | 24.479 |
| 7.16710993525 | 24.472 |
| 7.1701737216111106 | 24.464 |
| 7.173233896638889 | 24.464 |
| 7.1762960162222225 | 24.479 |
| 7.179359802583334 | 24.464 |
| 7.182421088777778 | 24.472 |
| 7.185483763944444 | 24.464 |
| 7.1885469947222225 | 24.441 |
| 7.191608280916667 | 24.464 |
| 7.194668178166666 | 24.434 |
| 7.197730575527777 | 24.441 |
| 7.200790750583333 | 24.441 |
| 7.203851759 | 24.449 |
| 7.206913878583333 | 24.449 |
| 7.209975164777777 | 24.441 |
| 7.21303561761111 | 24.449 |
| 7.216099403944445 | 24.426 |
| 7.2191590233888885 | 24.449 |
| 7.222219754027778 | 24.441 |
| 7.225279373472222 | 24.449 |
| 7.228342604222222 | 24.457 |
| 7.231405001611112 | 24.434 |
| 7.234464621055555 | 24.449 |
| 7.237526462833334 | 24.449 |
| 7.24058747125 | 24.434 |
| 7.243647924083334 | 24.441 |
| 7.246710043666666 | 24.426 |
| 7.249771052083333 | 24.441 |
| 7.252834560638889 | 24.441 |
| 7.255898902583334 | 24.434 |
| 7.258959911 | 24.464 |
| 7.262021197194445 | 24.472 |
| 7.265093595138889 | 24.464 |
| 7.2681529368055555 | 24.464 |
| 7.27121255625 | 24.457 |
| 7.2742724535 | 24.495 |
| 7.277331795138889 | 24.472 |
| 7.280392247972222 | 24.487 |
| 7.28345408975 | 24.472 |
| 7.286513431416667 | 24.502 |
| 7.289575551 | 24.502 |
| 7.29263878175 | 24.533 |
| 7.295698401194445 | 24.533 |
| 7.298763298722222 | 24.556 |
| 7.301828474055555 | 24.548 |
| 7.304888926861111 | 24.563 |
| 7.3079488241111115 | 24.556 |
| 7.311008999138889 | 24.563 |
| 7.314068340805556 | 24.563 |
| 7.317128515833334 | 24.556 |
| 7.320188968638889 | 24.571 |
| 7.3232496992777785 | 24.563 |
| 7.3263115410555555 | 24.571 |
| 7.329372271694445 | 24.571 |
| 7.332432168916666 | 24.571 |
| 7.335492899527778 | 24.563 |
| 7.338556963694445 | 24.571 |
| 7.341616860916666 | 24.571 |
| 7.344678424916667 | 24.571 |
| 7.347741100083333 | 24.579 |
| 7.350805997611111 | 24.571 |
| 7.353865894861111 | 24.594 |
| 7.3569605163055565 | 24.571 |
| 7.360022635888889 | 24.594 |
| 7.363090033555555 | 24.579 |
| 7.366150208583333 | 24.579 |
| 7.3692151061111115 | 24.571 |
| 7.372274725555555 | 24.579 |
| 7.375339067500001 | 24.594 |
| 7.378400909305555 | 24.579 |
| 7.381478029749999 | 24.571 |
| 7.384538482555556 | 24.571 |
| 7.3876019911111115 | 24.571 |
| 7.390661610555555 | 24.571 |
| 7.393723174555555 | 24.563 |
| 7.396782794 | 24.556 |
| 7.399852969611111 | 24.54 |
| 7.402914255833334 | 24.54 |
| 7.405976931 | 24.533 |
| 7.409036272638889 | 24.533 |
| 7.4121017257499995 | 24.533 |
| 7.415162456388889 | 24.54 |
| 7.418224575972222 | 24.518 |
| 7.421286973333333 | 24.518 |
| 7.424346592805556 | 24.495 |
| 7.427405934444445 | 24.502 |
| 7.430468054027777 | 24.502 |
| 7.433529062444444 | 24.51 |
| 7.43659090425 | 24.51 |
| 7.439651079277778 | 24.502 |
| 7.442712643277778 | 24.495 |
| 7.445785041222222 | 24.479 |
| 7.448844938472222 | 24.487 |
| 7.451907613638888 | 24.479 |
| 7.454967788666666 | 24.479 |
| 7.458027408111111 | 24.495 |
| 7.461088972111111 | 24.495 |
| 7.464150536111111 | 24.479 |
| 7.467216544805555 | 24.495 |
| 7.470277275444444 | 24.51 |
| 7.473339395027778 | 24.495 |
| 7.476402625777778 | 24.495 |
| 7.479461967444444 | 24.502 |
| 7.4825235314444445 | 24.502 |
| 7.485582873083333 | 24.502 |
| 7.488648326194444 | 24.502 |
| 7.491711834749999 | 24.51 |
| 7.4947728431666665 | 24.518 |
| 7.497836073916666 | 24.525 |
| 7.500897915722223 | 24.525 |
| 7.503958368555556 | 24.525 |
| 7.507019932555556 | 24.525 |
| 7.510079274194444 | 24.533 |
| 7.513138893638889 | 24.533 |
| 7.516199346472222 | 24.533 |
| 7.519262299444445 | 24.548 |
| 7.522322196666666 | 24.54 |
| 7.5253818161111115 | 24.54 |
| 7.528441157777778 | 24.533 |
| 7.5315057775 | 24.525 |
| 7.534569008277778 | 24.548 |
| 7.537628627722222 | 24.54 |
| 7.540688247166666 | 24.533 |
| 7.543748144388889 | 24.548 |
| 7.546808041638888 | 24.548 |
| 7.549869883416667 | 24.548 |
| 7.552935892111111 | 24.525 |
| 7.55599662275 | 24.525 |
| 7.559061798055556 | 24.525 |
| 7.5621211397222226 | 24.525 |
| 7.565182148111111 | 24.533 |
| 7.568245378888889 | 24.525 |
| 7.571308609638889 | 24.525 |
| 7.574367951305556 | 24.518 |
| 7.577431182055555 | 24.525 |
| 7.58049469061111 | 24.533 |
| 7.583554865638889 | 24.54 |
| 7.586615040694444 | 24.54 |
| 7.589689660972222 | 24.548 |
| 7.592750113805556 | 24.548 |
| 7.5958108444166665 | 24.548 |
| 7.59887601975 | 24.571 |
| 7.601935639194445 | 24.571 |
| 7.604996092027778 | 24.563 |
| 7.608057100444444 | 24.586 |
| 7.611117831055555 | 24.594 |
| 7.614180784027778 | 24.594 |
| 7.617240403472222 | 24.586 |
| 7.620305300999999 | 24.594 |
| 7.623367976166667 | 24.571 |
| 7.626427873388889 | 24.579 |
| 7.629494715472222 | 24.586 |
| 7.632559613 | 24.586 |
| 7.635623399361111 | 24.586 |
| 7.638684129972223 | 24.586 |
| 7.641745138388888 | 24.594 |
| 7.644810313694445 | 24.602 |
| 7.6478718776944445 | 24.602 |
| 7.65093205275 | 24.594 |
| 7.654001117166667 | 24.602 |
| 7.657070459388889 | 24.602 |
| 7.660130912222222 | 24.602 |
| 7.663196087527777 | 24.602 |
| 7.666255984777778 | 24.609 |
| 7.66931893775 | 24.609 |
| 7.672378279388889 | 24.602 |
| 7.675437621055556 | 24.609 |
| 7.678497518277777 | 24.609 |
| 7.6815607490555555 | 24.609 |
| 7.684620646277778 | 24.602 |
| 7.687679987944445 | 24.617 |
| 7.690739885166667 | 24.602 |
| 7.693799782416666 | 24.594 |
| 7.696862457583333 | 24.586 |
| 7.699930410833333 | 24.602 |
| 7.702990030277777 | 24.571 |
| 7.7060510386944445 | 24.563 |
| 7.709114269472222 | 24.556 |
| 7.712181944916667 | 24.563 |
| 7.715242397750001 | 24.54 |
| 7.718304239527778 | 24.548 |
| 7.721364136777778 | 24.533 |
| 7.724431256666667 | 24.533 |
| 7.727495598583333 | 24.518 |
| 7.730554662444445 | 24.51 |
| 7.733619004388888 | 24.51 |
| 7.736681679555556 | 24.502 |
| 7.739745743694445 | 24.495 |
| 7.742806474333333 | 24.487 |
| 7.745866371555556 | 24.51 |
| 7.748929046722223 | 24.495 |
| 7.751988388388889 | 24.479 |
| 7.755047730027778 | 24.464 |
| 7.7581137387500005 | 24.464 |
| 7.76117863625 | 24.472 |
| 7.76426714625 | 24.464 |
| 7.767328432444445 | 24.457 |
| 7.770388885277778 | 24.441 |
| 7.773449893694444 | 24.449 |
| 7.776513957833333 | 24.449 |
| 7.779575799638889 | 24.449 |
| 7.782636252444445 | 24.457 |
| 7.785696983083333 | 24.434 |
| 7.78875965825 | 24.434 |
| 7.791822889 | 24.441 |
| 7.794883341833333 | 24.434 |
| 7.797944628055555 | 24.434 |
| 7.80100591425 | 24.434 |
| 7.804066367083334 | 24.418 |
| 7.807130431222222 | 24.434 |
| 7.810191161833333 | 24.434 |
| 7.813256059361112 | 24.441 |
| 7.816322068055555 | 24.418 |
| 7.819382798694445 | 24.426 |
| 7.822444640472222 | 24.396 |
| 7.825507315638889 | 24.403 |
| 7.828567212888888 | 24.411 |
| 7.8316265545277775 | 24.403 |
| 7.8346958967499996 | 24.411 |
| 7.837755516194444 | 24.418 |
| 7.840815969027778 | 24.403 |
| 7.843875310694445 | 24.411 |
| 7.846936596888889 | 24.396 |
| 7.849999272055555 | 24.403 |
| 7.853064447388888 | 24.403 |
| 7.8561243446111115 | 24.403 |
| 7.8591836862777775 | 24.396 |
| 7.862247472611111 | 24.396 |
| 7.865310981166666 | 24.396 |
| 7.8683753231111115 | 24.403 |
| 7.871438276083333 | 24.396 |
| 7.874497895527778 | 24.396 |
| 7.877556959388889 | 24.403 |
| 7.880625468222222 | 24.388 |
| 7.883685365472222 | 24.388 |
| 7.886750540777777 | 24.403 |
| 7.889848773555556 | 24.396 |
| 7.892909781972222 | 24.38 |
| 7.895974123888889 | 24.403 |
| 7.899037632444444 | 24.411 |
| 7.9020978075 | 24.396 |
| 7.905157149138889 | 24.396 |
| 7.908219268722222 | 24.403 |
| 7.911279165972222 | 24.403 |
| 7.914353786277777 | 24.403 |
| 7.917414794666667 | 24.403 |
| 7.920474969722222 | 24.411 |
| 7.923553479138889 | 24.418 |
| 7.926625599277778 | 24.403 |
| 7.929690496805556 | 24.434 |
| 7.932769006222222 | 24.434 |
| 7.935828903472222 | 24.449 |
| 7.938890467472222 | 24.449 |
| 7.941953698222222 | 24.457 |
| 7.945014706638888 | 24.487 |
| 7.948084604444445 | 24.487 |
| 7.951148946388889 | 24.479 |
| 7.954216621833334 | 24.487 |
| 7.9572809637777775 | 24.495 |
| 7.960340027638889 | 24.51 |
| 7.963402980611112 | 24.525 |
| 7.9664637112222225 | 24.51 |
| 7.969524719638889 | 24.51 |
| 7.9726101738888895 | 24.518 |
| 7.975673404666667 | 24.525 |
| 7.978733857472222 | 24.525 |
| 7.981794865888889 | 24.518 |
| 7.984856707694445 | 24.525 |
| 7.98792021625 | 24.548 |
| 7.990984558194444 | 24.54 |
| 7.994045011000001 | 24.525 |
| 7.997111019722222 | 24.556 |
| 8.000172583722222 | 24.54 |
| 8.003232480944444 | 24.533 |
| 8.006292378194445 | 24.518 |
| 8.009358109083333 | 24.51 |
| 8.01241828411111 | 24.525 |
| 8.015482626055556 | 24.51 |
| 8.01854780138889 | 24.502 |
| 8.02161019875 | 24.51 |
| 8.02467231836111 | 24.487 |
| 8.02773166 | 24.495 |
| 8.030807113694445 | 24.495 |
| 8.033866455333333 | 24.479 |
| 8.036930241694444 | 24.479 |
| 8.039990416722222 | 24.464 |
| 8.043063925833334 | 24.472 |
| 8.046123545277778 | 24.457 |
| 8.049185942666666 | 24.441 |
| 8.052253340333333 | 24.449 |
| 8.055313237583333 | 24.441 |
| 8.058374246 | 24.441 |
| 8.061436365583333 | 24.457 |
| 8.064497651777778 | 24.464 |
| 8.067558382388889 | 24.441 |
| 8.070627446833333 | 24.441 |
| 8.073695677888889 | 24.441 |
| 8.076759742027777 | 24.441 |
| 8.079827417472222 | 24.441 |
| 8.082888981472223 | 24.441 |
| 8.085961935027777 | 24.457 |
| 8.089026554750001 | 24.441 |
| 8.092085896416666 | 24.441 |
| 8.095147182611111 | 24.434 |
| 8.09820958 | 24.434 |
| 8.101268921638889 | 24.434 |
| 8.10432881888889 | 24.434 |
| 8.107392605222222 | 24.434 |
| 8.110452502472222 | 24.441 |
| 8.113515733222222 | 24.426 |
| 8.116575908277778 | 24.426 |
| 8.119643028138888 | 24.426 |
| 8.122710148 | 24.426 |
| 8.125770878638889 | 24.411 |
| 8.12883244263889 | 24.411 |
| 8.131893451055555 | 24.411 |
| 8.134952792694444 | 24.403 |
| 8.138012689944444 | 24.396 |
| 8.141073420555555 | 24.396 |
| 8.14413304 | 24.396 |
| 8.147195159583333 | 24.396 |
| 8.15025450125 | 24.38 |
| 8.153318009805556 | 24.38 |
| 8.156385407472222 | 24.388 |
| 8.159446138083332 | 24.373 |
| 8.16250631311111 | 24.38 |
| 8.16556565475 | 24.38 |
| 8.168624996416666 | 24.373 |
| 8.171685171444445 | 24.38 |
| 8.174750902361112 | 24.365 |
| 8.177815799888888 | 24.38 |
| 8.180885975472222 | 24.357 |
| 8.183948928444444 | 24.365 |
| 8.187011603611111 | 24.365 |
| 8.190073445416667 | 24.357 |
| 8.193138898527778 | 24.373 |
| 8.196201573694443 | 24.373 |
| 8.199261470944444 | 24.373 |
| 8.202323034944444 | 24.357 |
| 8.205395432888889 | 24.35 |
| 8.208458108083333 | 24.357 |
| 8.211517171916666 | 24.365 |
| 8.21457845813889 | 24.38 |
| 8.217637522 | 24.373 |
| 8.220697419222223 | 24.396 |
| 8.223762038972222 | 24.396 |
| 8.226822491777778 | 24.38 |
| 8.229889889444443 | 24.396 |
| 8.2329581205 | 24.403 |
| 8.236021073472223 | 24.411 |
| 8.239080970722222 | 24.396 |
| 8.242140867944444 | 24.411 |
| 8.245200487388889 | 24.411 |
| 8.248261218 | 24.411 |
| 8.25133000463889 | 24.418 |
| 8.254394624388889 | 24.426 |
| 8.257457577361112 | 24.449 |
| 8.260520252527778 | 24.449 |
| 8.263583761083334 | 24.441 |
| 8.266645325083333 | 24.449 |
| 8.269710778194444 | 24.464 |
| 8.272771786611111 | 24.464 |
| 8.275833906194444 | 24.464 |
| 8.278893525638889 | 24.479 |
| 8.281952867277777 | 24.495 |
| 8.28501193113889 | 24.495 |
| 8.288073217361111 | 24.502 |
| 8.291132836805556 | 24.495 |
| 8.294193567416666 | 24.495 |
| 8.297254853611111 | 24.525 |
| 8.300314195277778 | 24.51 |
| 8.303379648388889 | 24.518 |
| 8.306439267833333 | 24.533 |
| 8.309498887277778 | 24.502 |
| 8.312559617888889 | 24.51 |
| 8.315618959555556 | 24.518 |
| 8.318678301194446 | 24.518 |
| 8.32174180975 | 24.518 |
| 8.324808374027779 | 24.502 |
| 8.32786966025 | 24.51 |
| 8.33093983586111 | 24.51 |
| 8.333998899694445 | 24.518 |
| 8.337059908111112 | 24.51 |
| 8.340123416666666 | 24.502 |
| 8.343182480527778 | 24.51 |
| 8.346247378055555 | 24.502 |
| 8.3493069975 | 24.495 |
| 8.352368839305555 | 24.495 |
| 8.355428736527779 | 24.51 |
| 8.358488355972222 | 24.502 |
| 8.361557698194446 | 24.518 |
| 8.36462120675 | 24.51 |
| 8.367682492972222 | 24.502 |
| 8.370742112416666 | 24.51 |
| 8.373803120833333 | 24.518 |
| 8.376863295861112 | 24.502 |
| 8.379923193083332 | 24.502 |
| 8.3829842015 | 24.51 |
| 8.386046043305555 | 24.502 |
| 8.389109829638889 | 24.525 |
| 8.392169449083333 | 24.518 |
| 8.395229901916666 | 24.502 |
| 8.398289243583333 | 24.51 |
| 8.401351363166667 | 24.51 |
| 8.404415982888889 | 24.502 |
| 8.407482824972222 | 24.525 |
| 8.410542166611112 | 24.502 |
| 8.413601508277777 | 24.518 |
| 8.416662516694444 | 24.495 |
| 8.419721858333334 | 24.495 |
| 8.422783977916668 | 24.487 |
| 8.425844152944444 | 24.502 |
| 8.4289076615 | 24.495 |
| 8.431968392138888 | 24.487 |
| 8.4350307895 | 24.464 |
| 8.438091797916666 | 24.487 |
| 8.441166696027778 | 24.479 |
| 8.444230760166667 | 24.495 |
| 8.447290935194445 | 24.479 |
| 8.450351388027778 | 24.502 |
| 8.453412952027778 | 24.479 |
| 8.456473960444445 | 24.487 |
| 8.4595408025 | 24.495 |
| 8.462600977555555 | 24.479 |
| 8.465660319194445 | 24.495 |
| 8.468720494222222 | 24.479 |
| 8.471780113666666 | 24.502 |
| 8.474847233555556 | 24.487 |
| 8.477910186527778 | 24.487 |
| 8.480975361833334 | 24.495 |
| 8.484039425972222 | 24.518 |
| 8.48710043438889 | 24.502 |
| 8.490160331638888 | 24.51 |
| 8.493220506666667 | 24.495 |
| 8.496286515361112 | 24.495 |
| 8.4993505795 | 24.502 |
| 8.50241131011111 | 24.502 |
| 8.505472318527778 | 24.502 |
| 8.508533882527777 | 24.502 |
| 8.511594890944444 | 24.495 |
| 8.51465506597222 | 24.51 |
| 8.517715518805556 | 24.495 |
| 8.520777082805555 | 24.495 |
| 8.523837257833334 | 24.487 |
| 8.526899655222222 | 24.502 |
| 8.529967608472221 | 24.495 |
| 8.533032228194445 | 24.518 |
| 8.536092681027778 | 24.502 |
| 8.539153411638889 | 24.518 |
| 8.542213864472222 | 24.502 |
| 8.545275706277778 | 24.518 |
| 8.548337270277777 | 24.518 |
| 8.551409668222222 | 24.525 |
| 8.554473732361112 | 24.525 |
| 8.557533351805555 | 24.525 |
| 8.56060324961111 | 24.54 |
| 8.563669813916666 | 24.525 |
| 8.566729155555555 | 24.548 |
| 8.569790719555556 | 24.556 |
| 8.572850616805555 | 24.556 |
| 8.575912736388888 | 24.548 |
| 8.578975133777778 | 24.556 |
| 8.582041142472223 | 24.563 |
| 8.585104651027777 | 24.556 |
| 8.58816538163889 | 24.594 |
| 8.591230279166668 | 24.563 |
| 8.594292954333334 | 24.579 |
| 8.59735618511111 | 24.586 |
| 8.600416082333334 | 24.586 |
| 8.603475979583333 | 24.586 |
| 8.606546432972221 | 24.586 |
| 8.609606330222222 | 24.586 |
| 8.612666783027779 | 24.586 |
| 8.615729736 | 24.602 |
| 8.618788799861111 | 24.602 |
| 8.621850086083333 | 24.602 |
| 8.624913872416666 | 24.602 |
| 8.62797432525 | 24.609 |
| 8.631036167055555 | 24.579 |
| 8.634095508694443 | 24.609 |
| 8.637155961527778 | 24.586 |
| 8.640220025666666 | 24.602 |
| 8.64328686775 | 24.586 |
| 8.646351765277778 | 24.586 |
| 8.649412218083334 | 24.579 |
| 8.6524826715 | 24.571 |
| 8.65554201313889 | 24.586 |
| 8.658606355083334 | 24.571 |
| 8.66166653011111 | 24.586 |
| 8.66472642736111 | 24.594 |
| 8.667792436055556 | 24.594 |
| 8.670852333277777 | 24.602 |
| 8.673911952722221 | 24.586 |
| 8.676971572166668 | 24.586 |
| 8.680033136166667 | 24.586 |
| 8.683093033416666 | 24.571 |
| 8.68615598638889 | 24.556 |
| 8.689216994805555 | 24.556 |
| 8.692287448194444 | 24.525 |
| 8.695349012194445 | 24.548 |
| 8.698415576472222 | 24.533 |
| 8.701479362833334 | 24.533 |
| 8.704539815666667 | 24.51 |
| 8.707599990694444 | 24.51 |
| 8.710660165722222 | 24.51 |
| 8.713743675416668 | 24.502 |
| 8.716808295138888 | 24.495 |
| 8.719868192388889 | 24.495 |
| 8.722927534027777 | 24.502 |
| 8.725987153472222 | 24.495 |
| 8.729052884388889 | 24.495 |
| 8.732111948250001 | 24.479 |
| 8.735172678861112 | 24.502 |
| 8.738234520666667 | 24.479 |
| 8.741299695972222 | 24.464 |
| 8.744358759833334 | 24.464 |
| 8.74742365736111 | 24.457 |
| 8.750484110194444 | 24.457 |
| 8.753556785944443 | 24.472 |
| 8.756618349944445 | 24.464 |
| 8.759686580972222 | 24.472 |
| 8.762745644833334 | 24.464 |
| 8.7658130425 | 24.457 |
| 8.76887293975 | 24.457 |
| 8.77194255975 | 24.457 |
| 8.775003568166667 | 24.457 |
| 8.778062909833334 | 24.449 |
| 8.781124751611111 | 24.464 |
| 8.784191315916667 | 24.457 |
| 8.7872534355 | 24.464 |
| 8.790322499916668 | 24.464 |
| 8.793381841583333 | 24.487 |
| 8.796443127777778 | 24.464 |
| 8.799503025027777 | 24.464 |
| 8.802567089166667 | 24.457 |
| 8.80562920875 | 24.457 |
| 8.808699939944445 | 24.457 |
| 8.811763170694444 | 24.457 |
| 8.81487029286111 | 24.457 |
| 8.817929912305555 | 24.434 |
| 8.820991476305554 | 24.434 |
| 8.82405192913889 | 24.434 |
| 8.827114604305555 | 24.418 |
| 8.830175057138888 | 24.418 |
| 8.833243565972221 | 24.411 |
| 8.836305129972223 | 24.418 |
| 8.839380861444445 | 24.403 |
| 8.84244048088889 | 24.403 |
| 8.845502878277777 | 24.403 |
| 8.848570275944445 | 24.396 |
| 8.851629339805555 | 24.388 |
| 8.854697015277777 | 24.396 |
| 8.85776385736111 | 24.373 |
| 8.860823754583333 | 24.38 |
| 8.863887263138889 | 24.396 |
| 8.866948827138888 | 24.373 |
| 8.870012057916668 | 24.388 |
| 8.873071399555554 | 24.373 |
| 8.876131574583333 | 24.396 |
| 8.879191194027777 | 24.388 |
| 8.88225164686111 | 24.403 |
| 8.8853109885 | 24.411 |
| 8.888371441333334 | 24.396 |
| 8.891431338583333 | 24.411 |
| 8.894497625055555 | 24.388 |
| 8.897580023583334 | 24.403 |
| 8.900654088305556 | 24.403 |
| 8.90371370775 | 24.418 |
| 8.906773327194445 | 24.426 |
| 8.90983683575 | 24.434 |
| 8.912899510916667 | 24.449 |
| 8.915961352722222 | 24.449 |
| 8.919022638916667 | 24.457 |
| 8.922081980583334 | 24.472 |
| 8.925145766916666 | 24.487 |
| 8.928206497555555 | 24.487 |
| 8.931268617138889 | 24.495 |
| 8.934329069972222 | 24.502 |
| 8.937389522777778 | 24.518 |
| 8.940449975611111 | 24.518 |
| 8.943509595055556 | 24.525 |
| 8.946572548027778 | 24.518 |
| 8.949646334944445 | 24.525 |
| 8.952723455388888 | 24.54 |
| 8.955783908222221 | 24.533 |
| 8.958844916638888 | 24.533 |
| 8.961908425194444 | 24.54 |
| 8.964967766833333 | 24.525 |
| 8.968032664361111 | 24.525 |
| 8.971096450722222 | 24.525 |
| 8.974159681472221 | 24.54 |
| 8.977220967694445 | 24.533 |
| 8.980287531972222 | 24.525 |
| 8.983349651555555 | 24.518 |
| 8.986410659972222 | 24.533 |
| 8.989470279416667 | 24.533 |
| 8.992531565611111 | 24.525 |
| 8.995594796388888 | 24.533 |
| 8.998654693611112 | 24.525 |
| 9.001714868638889 | 24.54 |
| 9.004775321472222 | 24.525 |
| 9.007834940916666 | 24.525 |
| 9.010900116250001 | 24.525 |
| 9.013961124666666 | 24.525 |
| 9.017022688666668 | 24.51 |
| 9.02008230811111 | 24.502 |
| 9.023146094444444 | 24.502 |
| 9.026206547277777 | 24.495 |
| 9.029270611416667 | 24.487 |
| 9.032331619833334 | 24.479 |
| 9.035394017222222 | 24.487 |
| 9.03845335886111 | 24.479 |
| 9.041517978583334 | 24.479 |
| 9.04457815363889 | 24.464 |
| 9.047656107444444 | 24.479 |
| 9.050720171583333 | 24.464 |
| 9.053779791027779 | 24.464 |
| 9.056840799444444 | 24.464 |
| 9.059904863583334 | 24.449 |
| 9.062966427583333 | 24.441 |
| 9.066026047027778 | 24.457 |
| 9.069087611027777 | 24.441 |
| 9.072149175055555 | 24.434 |
| 9.075209627861112 | 24.441 |
| 9.078272303055556 | 24.449 |
| 9.081333033666667 | 24.449 |
| 9.084400986916668 | 24.441 |
| 9.087464217666668 | 24.441 |
| 9.090537449 | 24.434 |
| 9.093604846666667 | 24.434 |
| 9.09666752186111 | 24.441 |
| 9.099727141305555 | 24.434 |
| 9.102793427805556 | 24.441 |
| 9.105853047250001 | 24.426 |
| 9.108913222277778 | 24.434 |
| 9.1119731195 | 24.464 |
| 9.115033294527779 | 24.449 |
| 9.118097914277778 | 24.434 |
| 9.121161978416666 | 24.441 |
| 9.124222153444446 | 24.457 |
| 9.127289273333334 | 24.457 |
| 9.130352781888888 | 24.457 |
| 9.13341434588889 | 24.441 |
| 9.136478687805557 | 24.464 |
| 9.139539140638888 | 24.464 |
| 9.142601260222222 | 24.472 |
| 9.14567115802778 | 24.464 |
| 9.148732999833333 | 24.441 |
| 9.151800953083333 | 24.457 |
| 9.154861405916666 | 24.441 |
| 9.157921025361112 | 24.441 |
| 9.16098342275 | 24.426 |
| 9.164042764388888 | 24.411 |
| 9.16710266163889 | 24.418 |
| 9.17016200327778 | 24.403 |
| 9.173221622722222 | 24.403 |
| 9.176284853472223 | 24.388 |
| 9.179349195416668 | 24.403 |
| 9.182409926027779 | 24.396 |
| 9.185469267694446 | 24.396 |
| 9.188529164916666 | 24.411 |
| 9.191589617750001 | 24.411 |
| 9.194651459555555 | 24.418 |
| 9.197726913222223 | 24.441 |
| 9.200786532666667 | 24.426 |
| 9.203851430194446 | 24.441 |
| 9.206912438611111 | 24.441 |
| 9.209972613638888 | 24.441 |
| 9.213032788666666 | 24.434 |
| 9.21609407488889 | 24.457 |
| 9.219156472277778 | 24.457 |
| 9.222216647305556 | 24.449 |
| 9.225279600277778 | 24.457 |
| 9.228345608972223 | 24.457 |
| 9.231411895472222 | 24.464 |
| 9.234473459472223 | 24.457 |
| 9.237533078916666 | 24.464 |
| 9.240595754083333 | 24.487 |
| 9.243654817944444 | 24.479 |
| 9.246714159583332 | 24.479 |
| 9.249782668416668 | 24.502 |
| 9.252842010083334 | 24.495 |
| 9.255904963055556 | 24.502 |
| 9.258967638222222 | 24.495 |
| 9.26202781325 | 24.487 |
| 9.265097711055557 | 24.502 |
| 9.268162330805556 | 24.51 |
| 9.271228895083334 | 24.487 |
| 9.274292125833332 | 24.487 |
| 9.277358134555556 | 24.464 |
| 9.280434699416668 | 24.479 |
| 9.283496541194443 | 24.472 |
| 9.286558383000001 | 24.464 |
| 9.289618280222223 | 24.472 |
| 9.292677899666668 | 24.487 |
| 9.295741963805556 | 24.472 |
| 9.298801861055555 | 24.479 |
| 9.301863980638888 | 24.472 |
| 9.30492554463889 | 24.472 |
| 9.307985719666668 | 24.449 |
| 9.311057562055556 | 24.457 |
| 9.314118570444446 | 24.472 |
| 9.317179856666666 | 24.457 |
| 9.320239476111112 | 24.457 |
| 9.323307984944444 | 24.457 |
| 9.326372882472223 | 24.479 |
| 9.329432501916665 | 24.472 |
| 9.332502121944446 | 24.472 |
| 9.335563408138889 | 24.441 |
| 9.338626083305556 | 24.464 |
| 9.341693203194446 | 24.449 |
| 9.344752822638888 | 24.441 |
| 9.347815497805556 | 24.449 |
| 9.350875395055555 | 24.449 |
| 9.353943626083334 | 24.426 |
| 9.357006579055556 | 24.441 |
| 9.360070087611112 | 24.434 |
| 9.363133318388888 | 24.418 |
| 9.366195160166667 | 24.426 |
| 9.369254501833334 | 24.441 |
| 9.372315232444445 | 24.426 |
| 9.375377074249998 | 24.426 |
| 9.378439749416666 | 24.434 |
| 9.381509369444444 | 24.426 |
| 9.384569266666666 | 24.434 |
| 9.38763055288889 | 24.411 |
| 9.39069850613889 | 24.418 |
| 9.393760347916666 | 24.426 |
| 9.396820522972222 | 24.411 |
| 9.399880697999999 | 24.403 |
| 9.402940039638889 | 24.418 |
| 9.405999659083335 | 24.411 |
| 9.409062889861112 | 24.426 |
| 9.412122787083334 | 24.403 |
| 9.41518629563889 | 24.426 |
| 9.418246192888889 | 24.403 |
| 9.421308868055556 | 24.411 |
| 9.4243684875 | 24.426 |
| 9.427430329305555 | 24.411 |
| 9.430489948750001 | 24.388 |
| 9.433554012888889 | 24.411 |
| 9.436614743500002 | 24.403 |
| 9.439675751916667 | 24.411 |
| 9.442736482527778 | 24.388 |
| 9.445795824194445 | 24.403 |
| 9.448859610527776 | 24.396 |
| 9.451927008194444 | 24.403 |
| 9.454987738833333 | 24.403 |
| 9.458068192777777 | 24.396 |
| 9.461128090027778 | 24.411 |
| 9.46418854286111 | 24.426 |
| 9.467252606999999 | 24.426 |
| 9.470319726861112 | 24.426 |
| 9.473379068527779 | 24.426 |
| 9.4764420215 | 24.426 |
| 9.479501363138889 | 24.426 |
| 9.48256431611111 | 24.418 |
| 9.485623935555555 | 24.434 |
| 9.488686610722223 | 24.418 |
| 9.491751230472223 | 24.418 |
| 9.494810572111112 | 24.418 |
| 9.497871580527777 | 24.418 |
| 9.500949256555556 | 24.418 |
| 9.504008875999999 | 24.418 |
| 9.507074051333333 | 24.411 |
| 9.5101367265 | 24.426 |
| 9.51320384636111 | 24.418 |
| 9.516264299194445 | 24.426 |
| 9.51932530761111 | 24.426 |
| 9.52238464925 | 24.434 |
| 9.52544371311111 | 24.441 |
| 9.528513055333333 | 24.434 |
| 9.531578786250002 | 24.464 |
| 9.534645628333335 | 24.457 |
| 9.537708303499999 | 24.464 |
| 9.540777367916666 | 24.464 |
| 9.543839765305556 | 24.487 |
| 9.546898829166668 | 24.495 |
| 9.549958448611111 | 24.51 |
| 9.553017790277778 | 24.518 |
| 9.55608657688889 | 24.525 |
| 9.559147307527779 | 24.525 |
| 9.562207482555555 | 24.533 |
| 9.565268490972223 | 24.525 |
| 9.568330332750001 | 24.548 |
| 9.571391341166667 | 24.548 |
| 9.574454294138889 | 24.563 |
| 9.577513635777777 | 24.556 |
| 9.580577144333333 | 24.563 |
| 9.583642041861111 | 24.571 |
| 9.586701383527778 | 24.571 |
| 9.589762391944445 | 24.556 |
| 9.592823122555556 | 24.571 |
| 9.595885519944444 | 24.571 |
| 9.598948472916666 | 24.563 |
| 9.602011425861111 | 24.563 |
| 9.605072989861112 | 24.556 |
| 9.608137331805557 | 24.548 |
| 9.611198895805556 | 24.525 |
| 9.614260459805555 | 24.525 |
| 9.617319523666668 | 24.533 |
| 9.620378865333334 | 24.533 |
| 9.623443485055555 | 24.518 |
| 9.626503382277777 | 24.533 |
| 9.6295646685 | 24.502 |
| 9.632630677194445 | 24.502 |
| 9.635690018833332 | 24.487 |
| 9.638757138722223 | 24.518 |
| 9.64181731375 | 24.487 |
| 9.644881933472222 | 24.495 |
| 9.647943497472223 | 24.472 |
| 9.651003394722222 | 24.472 |
| 9.654063291972221 | 24.487 |
| 9.657123189194444 | 24.487 |
| 9.660183642027778 | 24.495 |
| 9.663244928222221 | 24.479 |
| 9.666307881194445 | 24.487 |
| 9.669367778444444 | 24.479 |
| 9.67242739788889 | 24.479 |
| 9.675493128777777 | 24.472 |
| 9.678555526166665 | 24.464 |
| 9.681626812944444 | 24.464 |
| 9.68468865475 | 24.464 |
| 9.687753830055556 | 24.449 |
| 9.690817060833334 | 24.449 |
| 9.693891403333334 | 24.457 |
| 9.696951022777778 | 24.441 |
| 9.700014253527778 | 24.434 |
| 9.703080540027777 | 24.441 |
| 9.706184328666668 | 24.426 |
| 9.70925756 | 24.434 |
| 9.71231690163889 | 24.426 |
| 9.71537985461111 | 24.441 |
| 9.71843975186111 | 24.426 |
| 9.721505760555555 | 24.426 |
| 9.724569546916666 | 24.396 |
| 9.727633055472221 | 24.403 |
| 9.730693508277778 | 24.403 |
| 9.733762572722222 | 24.388 |
| 9.736824970111112 | 24.388 |
| 9.739887923055555 | 24.403 |
| 9.7429475425 | 24.396 |
| 9.746007717555555 | 24.418 |
| 9.749068170361111 | 24.411 |
| 9.752136401416667 | 24.411 |
| 9.755197409833333 | 24.403 |
| 9.758267863222223 | 24.411 |
| 9.761328038250001 | 24.411 |
| 9.764405992083333 | 24.403 |
| 9.7674670005 | 24.426 |
| 9.770528842305556 | 24.426 |
| 9.77359735113889 | 24.403 |
| 9.776691139194446 | 24.418 |
| 9.779754369972222 | 24.396 |
| 9.782814544999999 | 24.403 |
| 9.78587472002778 | 24.418 |
| 9.788942117694443 | 24.418 |
| 9.792013960055556 | 24.403 |
| 9.795076357444444 | 24.434 |
| 9.798147088638888 | 24.434 |
| 9.80121004161111 | 24.426 |
| 9.80428994 | 24.441 |
| 9.807369560583334 | 24.449 |
| 9.810429180027779 | 24.449 |
| 9.81348991063889 | 24.449 |
| 9.81655064125 | 24.441 |
| 9.81963665111111 | 24.449 |
| 9.822698770694444 | 24.449 |
| 9.825758667916666 | 24.441 |
| 9.828819120750001 | 24.434 |
| 9.831879295777778 | 24.426 |
| 9.834941693166666 | 24.426 |
| 9.838002146000001 | 24.449 |
| 9.841070654833333 | 24.418 |
| 9.844130829861111 | 24.434 |
| 9.847202394444444 | 24.457 |
| 9.850267291972221 | 24.441 |
| 9.853326911416667 | 24.449 |
| 9.85639069775 | 24.441 |
| 9.859452817333333 | 24.434 |
| 9.8625168815 | 24.434 |
| 9.865577889888888 | 24.441 |
| 9.868638342722223 | 24.472 |
| 9.871702684666666 | 24.464 |
| 9.87476397086111 | 24.472 |
| 9.877823590305555 | 24.479 |
| 9.88088376536111 | 24.495 |
| 9.883950329638889 | 24.502 |
| 9.887010782472222 | 24.495 |
| 9.890089291861111 | 24.487 |
| 9.893148911305556 | 24.495 |
| 9.89620991972222 | 24.502 |
| 9.899269816972222 | 24.502 |
| 9.902329992 | 24.518 |
| 9.905389333666667 | 24.54 |
| 9.908449786472223 | 24.525 |
| 9.911522184444445 | 24.556 |
| 9.914583192833332 | 24.548 |
| 9.91764892375 | 24.533 |
| 9.920710765555555 | 24.525 |
| 9.92377205175 | 24.525 |
| 9.926835004722221 | 24.533 |
| 9.929901569 | 24.54 |
| 9.93297646711111 | 24.556 |
| 9.93604053125 | 24.556 |
| 9.939100706277777 | 24.533 |
| 9.942170604083332 | 24.563 |
| 9.945233001472223 | 24.548 |
| 9.948292065333334 | 24.548 |
| 9.951353351527779 | 24.548 |
| 9.954415193333334 | 24.533 |
| 9.957512592722223 | 24.548 |
| 9.960576656861111 | 24.54 |
| 9.963641276583335 | 24.54 |
| 9.966701729416666 | 24.533 |
| 9.969764126777779 | 24.525 |
| 9.972826246388887 | 24.518 |
| 9.9758916995 | 24.533 |
| 9.978952152305556 | 24.533 |
| 9.982013438527778 | 24.502 |
| 9.985073891361111 | 24.518 |
| 9.988136566527778 | 24.518 |
| 9.991213686972221 | 24.525 |
| 9.994276917722223 | 24.518 |
| 9.99733764836111 | 24.533 |
| 10.000403934833333 | 24.525 |
| 10.003467165611111 | 24.502 |
| 10.00652734063889 | 24.51 |
| 10.00958723788889 | 24.502 |
| 10.012652135388889 | 24.51 |
| 10.015713977194444 | 24.51 |
| 10.018774430027777 | 24.495 |
| 10.021844605611111 | 24.502 |
| 10.02490533625 | 24.479 |
| 10.027965511277777 | 24.479 |
| 10.031028186444445 | 24.472 |
| 10.034088639277778 | 24.464 |
| 10.037161037222223 | 24.472 |
| 10.040220934472222 | 24.464 |
| 10.04328027611111 | 24.457 |
| 10.046339895555555 | 24.464 |
| 10.04940340411111 | 24.449 |
| 10.052466634888889 | 24.441 |
| 10.055530976805555 | 24.449 |
| 10.05859142963889 | 24.449 |
| 10.061651604666666 | 24.449 |
| 10.064712613083332 | 24.441 |
| 10.067771954749999 | 24.441 |
| 10.070831851972223 | 24.434 |
| 10.073893415972222 | 24.449 |
| 10.076953590999999 | 24.441 |
| 10.08001821075 | 24.441 |
| 10.083078107972224 | 24.441 |
| 10.086140227555555 | 24.434 |
| 10.089200402611112 | 24.434 |
| 10.092263633361112 | 24.434 |
| 10.095323808388889 | 24.449 |
| 10.098399262083333 | 24.434 |
| 10.101463326222222 | 24.434 |
| 10.104524056833332 | 24.434 |
| 10.107583120694445 | 24.441 |
| 10.110642184555555 | 24.441 |
| 10.113710137805556 | 24.434 |
| 10.116770312833333 | 24.434 |
| 10.119830210083334 | 24.434 |
| 10.12289371863889 | 24.457 |
| 10.12596472761111 | 24.457 |
| 10.129024624861112 | 24.457 |
| 10.132093689277777 | 24.464 |
| 10.135155253277777 | 24.464 |
| 10.138214872722221 | 24.457 |
| 10.141277547916665 | 24.441 |
| 10.14434216763889 | 24.464 |
| 10.14740206488889 | 24.479 |
| 10.15046196211111 | 24.479 |
| 10.15352213713889 | 24.472 |
| 10.156582589972222 | 24.472 |
| 10.159644153972222 | 24.464 |
| 10.162704051222223 | 24.472 |
| 10.165770893305556 | 24.464 |
| 10.1688321795 | 24.457 |
| 10.171891243361111 | 24.457 |
| 10.174961418972222 | 24.457 |
| 10.178021316194444 | 24.441 |
| 10.181086491527777 | 24.441 |
| 10.18414638875 | 24.449 |
| 10.187207397166667 | 24.449 |
| 10.190270072333332 | 24.441 |
| 10.193330247388888 | 24.434 |
| 10.196394033722223 | 24.457 |
| 10.19945337538889 | 24.457 |
| 10.202517439527778 | 24.441 |
| 10.20557900352778 | 24.449 |
| 10.208639178555556 | 24.472 |
| 10.211699631388887 | 24.472 |
| 10.214763417722223 | 24.472 |
| 10.217824148333333 | 24.472 |
| 10.220885990138887 | 24.479 |
| 10.223945331777777 | 24.495 |
| 10.227006617999999 | 24.502 |
| 10.230067626416666 | 24.495 |
| 10.233130857166666 | 24.518 |
| 10.236192698972223 | 24.518 |
| 10.2392750975 | 24.518 |
| 10.24233443913889 | 24.525 |
| 10.245401003416665 | 24.518 |
| 10.24846117847222 | 24.525 |
| 10.251524131444445 | 24.525 |
| 10.254593195861112 | 24.525 |
| 10.257652815305555 | 24.518 |
| 10.260724657666668 | 24.525 |
| 10.26379066636111 | 24.525 |
| 10.266850563611111 | 24.533 |
| 10.26990990525 | 24.51 |
| 10.272970358083334 | 24.533 |
| 10.276029977527777 | 24.518 |
| 10.27909515286111 | 24.51 |
| 10.282155883472221 | 24.518 |
| 10.285217169666666 | 24.525 |
| 10.288276233527778 | 24.51 |
| 10.291339464305555 | 24.533 |
| 10.294400472694445 | 24.525 |
| 10.29745981436111 | 24.525 |
| 10.300519711583332 | 24.518 |
| 10.303579886638888 | 24.51 |
| 10.3066470065 | 24.518 |
| 10.309706070361111 | 24.51 |
| 10.312772912444444 | 24.502 |
| 10.31583336527778 | 24.51 |
| 10.318892984722222 | 24.502 |
| 10.32195399311111 | 24.51 |
| 10.325035836055557 | 24.487 |
| 10.328095177722222 | 24.472 |
| 10.331157852888888 | 24.464 |
| 10.334223306 | 24.464 |
| 10.337282369861112 | 24.464 |
| 10.3403417115 | 24.464 |
| 10.34340160875 | 24.457 |
| 10.346463450527779 | 24.464 |
| 10.349526681305557 | 24.449 |
| 10.352586578527777 | 24.449 |
| 10.355646197972224 | 24.464 |
| 10.358713873444445 | 24.434 |
| 10.361776270833333 | 24.472 |
| 10.36483727925 | 24.441 |
| 10.367899121027778 | 24.441 |
| 10.370960962833333 | 24.441 |
| 10.374029193888889 | 24.449 |
| 10.377095480361112 | 24.434 |
| 10.380160655694445 | 24.434 |
| 10.383221941888888 | 24.426 |
| 10.3862826725 | 24.434 |
| 10.389345903277778 | 24.441 |
| 10.392407467277778 | 24.441 |
| 10.395467920111113 | 24.426 |
| 10.398528372916667 | 24.418 |
| 10.401587992361112 | 24.426 |
| 10.404648445194445 | 24.418 |
| 10.407707786833333 | 24.426 |
| 10.410769628638889 | 24.426 |
| 10.413829525888888 | 24.426 |
| 10.416889700916666 | 24.426 |
| 10.419949875944443 | 24.434 |
| 10.42300949538889 | 24.434 |
| 10.426070226 | 24.426 |
| 10.429137345888888 | 24.426 |
| 10.4321980765 | 24.426 |
| 10.435257418138889 | 24.426 |
| 10.438320093333333 | 24.418 |
| 10.441383879666667 | 24.434 |
| 10.444446277055556 | 24.426 |
| 10.447509230027778 | 24.441 |
| 10.45056912727778 | 24.434 |
| 10.453630691277779 | 24.434 |
| 10.456700311277778 | 24.426 |
| 10.459772153638887 | 24.434 |
| 10.46283427322222 | 24.426 |
| 10.465897226194445 | 24.434 |
| 10.468959068 | 24.434 |
| 10.472018409638888 | 24.434 |
| 10.47507830688889 | 24.426 |
| 10.478144037805555 | 24.434 |
| 10.481205879583333 | 24.426 |
| 10.484265499027778 | 24.426 |
| 10.487325396277779 | 24.434 |
| 10.490385571305556 | 24.434 |
| 10.493447413083333 | 24.434 |
| 10.496507865916668 | 24.441 |
| 10.49956915213889 | 24.464 |
| 10.50262988275 | 24.457 |
| 10.50568922438889 | 24.457 |
| 10.508749399416667 | 24.472 |
| 10.511815130333334 | 24.479 |
| 10.51488475036111 | 24.487 |
| 10.517946036555555 | 24.487 |
| 10.521007878361111 | 24.495 |
| 10.524067775583333 | 24.495 |
| 10.527127672833334 | 24.51 |
| 10.530187292277777 | 24.51 |
| 10.533248856277776 | 24.533 |
| 10.536309031305557 | 24.548 |
| 10.5393703175 | 24.533 |
| 10.542436603999999 | 24.548 |
| 10.545499556972223 | 24.563 |
| 10.548559732000001 | 24.556 |
| 10.551619073666668 | 24.571 |
| 10.554680915444443 | 24.571 |
| 10.557741646083333 | 24.586 |
| 10.560803765666666 | 24.579 |
| 10.563863385111112 | 24.594 |
| 10.566930227194446 | 24.579 |
| 10.56999068 | 24.602 |
| 10.573057244305556 | 24.624 |
| 10.576118530499999 | 24.624 |
| 10.579177872166666 | 24.624 |
| 10.58223776938889 | 24.617 |
| 10.5852985 | 24.624 |
| 10.588357841666667 | 24.617 |
| 10.591422183611112 | 24.617 |
| 10.594487636722222 | 24.632 |
| 10.597547256166665 | 24.64 |
| 10.60060632 | 24.64 |
| 10.603676217833332 | 24.64 |
| 10.606735559472222 | 24.64 |
| 10.609797401277778 | 24.663 |
| 10.612858409666666 | 24.647 |
| 10.615918862500001 | 24.663 |
| 10.6189804265 | 24.632 |
| 10.62204115713889 | 24.647 |
| 10.625103554499999 | 24.64 |
| 10.628166507472223 | 24.64 |
| 10.631225849138888 | 24.64 |
| 10.634286579749999 | 24.663 |
| 10.637351477277777 | 24.663 |
| 10.640412763472222 | 24.64 |
| 10.643472382916668 | 24.647 |
| 10.646542002944445 | 24.647 |
| 10.649606067083335 | 24.663 |
| 10.652667353277778 | 24.64 |
| 10.655726694944445 | 24.64 |
| 10.65879437038889 | 24.64 |
| 10.661861490277778 | 24.655 |
| 10.664934443805555 | 24.647 |
| 10.668001563694444 | 24.632 |
| 10.671067294583334 | 24.655 |
| 10.674128303 | 24.647 |
| 10.677187644666667 | 24.647 |
| 10.680248097472223 | 24.647 |
| 10.683309105888888 | 24.64 |
| 10.686368447555557 | 24.64 |
| 10.689428067 | 24.632 |
| 10.692489908777778 | 24.624 |
| 10.695549250444445 | 24.617 |
| 10.698616092527779 | 24.617 |
| 10.701675711972223 | 24.624 |
| 10.704736164777778 | 24.602 |
| 10.707806895972222 | 24.594 |
| 10.710868182194444 | 24.594 |
| 10.713928357222223 | 24.594 |
| 10.716988254444445 | 24.579 |
| 10.72004787388889 | 24.594 |
| 10.723108048944445 | 24.594 |
| 10.72616933513889 | 24.602 |
| 10.72922923238889 | 24.586 |
| 10.732293574305556 | 24.586 |
| 10.735352915972223 | 24.586 |
| 10.738412535416666 | 24.609 |
| 10.741472988222222 | 24.602 |
| 10.744532885472221 | 24.579 |
| 10.747602783277777 | 24.594 |
| 10.750665180666665 | 24.602 |
| 10.753728411416667 | 24.594 |
| 10.756794975722222 | 24.571 |
| 10.759857928694444 | 24.586 |
| 10.762923937388889 | 24.563 |
| 10.765988279305557 | 24.594 |
| 10.769065121972222 | 24.594 |
| 10.772129741694444 | 24.571 |
| 10.775193805833332 | 24.556 |
| 10.77825564763889 | 24.563 |
| 10.781319433999998 | 24.571 |
| 10.784378775638888 | 24.563 |
| 10.787438117277777 | 24.556 |
| 10.790498014527778 | 24.556 |
| 10.793559300722222 | 24.54 |
| 10.796619753555555 | 24.54 |
| 10.799679372999998 | 24.533 |
| 10.80273927025 | 24.54 |
| 10.805800000861112 | 24.533 |
| 10.808866287361111 | 24.533 |
| 10.81193757413889 | 24.525 |
| 10.814999693722223 | 24.518 |
| 10.818060424333334 | 24.502 |
| 10.821126433027779 | 24.525 |
| 10.824186330277778 | 24.525 |
| 10.827282340694445 | 24.533 |
| 10.830341682333334 | 24.518 |
| 10.83340269075 | 24.518 |
| 10.836468143861111 | 24.51 |
| 10.839538041666666 | 24.51 |
| 10.84259932788889 | 24.502 |
| 10.845661725277777 | 24.502 |
| 10.848731345277779 | 24.518 |
| 10.85179040913889 | 24.525 |
| 10.854850584166666 | 24.502 |
| 10.857910203611112 | 24.51 |
| 10.860973156583334 | 24.518 |
| 10.864033609416666 | 24.525 |
| 10.867092951055556 | 24.525 |
| 10.870154792861111 | 24.533 |
| 10.873215245694444 | 24.533 |
| 10.876274865138889 | 24.533 |
| 10.879335873555556 | 24.518 |
| 10.882396326361112 | 24.533 |
| 10.885455668027777 | 24.525 |
| 10.88851778761111 | 24.548 |
| 10.89158435188889 | 24.54 |
| 10.8946450825 | 24.556 |
| 10.897715535916666 | 24.533 |
| 10.900782377999999 | 24.556 |
| 10.903842275222223 | 24.556 |
| 10.90690939511111 | 24.556 |
| 10.909970125722221 | 24.563 |
| 10.91302946736111 | 24.556 |
| 10.91609103136111 | 24.556 |
| 10.919152317583332 | 24.563 |
| 10.922213603777777 | 24.548 |
| 10.92527655675 | 24.556 |
| 10.928337842972223 | 24.548 |
| 10.931400240333332 | 24.548 |
| 10.934463748888888 | 24.556 |
| 10.937528646416668 | 24.548 |
| 10.940589654833333 | 24.563 |
| 10.94365233 | 24.556 |
| 10.94671222725 | 24.556 |
| 10.949772402277778 | 24.563 |
| 10.952831743944444 | 24.571 |
| 10.955893585722222 | 24.571 |
| 10.958974317500001 | 24.579 |
| 10.962035048111112 | 24.563 |
| 10.965094667555556 | 24.579 |
| 10.968163176388888 | 24.594 |
| 10.971222795833334 | 24.586 |
| 10.974283526472224 | 24.586 |
| 10.977345090472223 | 24.594 |
| 10.980408599027777 | 24.594 |
| 10.983468218472222 | 24.602 |
| 10.986528115694444 | 24.609 |
| 10.989589124111111 | 24.624 |
| 10.992651521500001 | 24.632 |
| 10.99571086313889 | 24.632 |
| 10.998772704944445 | 24.64 |
| 11.001832602166667 | 24.647 |
| 11.004892221611112 | 24.663 |
| 11.007951841055554 | 24.655 |
| 11.011015071833333 | 24.67 |
| 11.014078302583334 | 24.678 |
| 11.017142366722222 | 24.647 |
| 11.020206986472221 | 24.67 |
| 11.02326799488889 | 24.678 |
| 11.026328169916667 | 24.693 |
| 11.029399734472223 | 24.701 |
| 11.032458798333332 | 24.701 |
| 11.0355214735 | 24.693 |
| 11.03858609325 | 24.693 |
| 11.041648212833334 | 24.693 |
| 11.044709499027778 | 24.685 |
| 11.04777217422222 | 24.701 |
| 11.050832904833333 | 24.701 |
| 11.053894468833334 | 24.701 |
| 11.05695547725 | 24.663 |
| 11.060021208138888 | 24.678 |
| 11.063081383194444 | 24.693 |
| 11.06614489175 | 24.678 |
| 11.069206177944444 | 24.678 |
| 11.072268297527778 | 24.67 |
| 11.075329861527777 | 24.67 |
| 11.078390869944444 | 24.685 |
| 11.081458267611112 | 24.678 |
| 11.084517609277777 | 24.678 |
| 11.087577228722223 | 24.663 |
| 11.090637125944443 | 24.678 |
| 11.093700912305556 | 24.678 |
| 11.096769698944446 | 24.67 |
| 11.099831818527779 | 24.67 |
| 11.102900605166667 | 24.678 |
| 11.105962169166666 | 24.685 |
| 11.109028733444445 | 24.693 |
| 11.112093353166665 | 24.685 |
| 11.115156028361111 | 24.685 |
| 11.118215647805554 | 24.693 |
| 11.121274989444444 | 24.685 |
| 11.12433544227778 | 24.67 |
| 11.127399784194445 | 24.693 |
| 11.130467459666667 | 24.685 |
| 11.133529579249998 | 24.678 |
| 11.136590865472222 | 24.678 |
| 11.13965826313889 | 24.685 |
| 11.142718160361111 | 24.67 |
| 11.145782224500001 | 24.678 |
| 11.148843510722221 | 24.663 |
| 11.15190507472222 | 24.67 |
| 11.154969694444445 | 24.67 |
| 11.158032925222223 | 24.663 |
| 11.161098378333334 | 24.647 |
| 11.16416272025 | 24.655 |
| 11.167223450888889 | 24.647 |
| 11.170291681916666 | 24.647 |
| 11.173353245916665 | 24.64 |
| 11.176420921388889 | 24.64 |
| 11.179481374222222 | 24.64 |
| 11.182542660416667 | 24.624 |
| 11.185608946916666 | 24.632 |
| 11.1886710665 | 24.64 |
| 11.19173013036111 | 24.647 |
| 11.194796139055555 | 24.64 |
| 11.197857147472224 | 24.663 |
| 11.200922322777778 | 24.647 |
| 11.20398194222222 | 24.655 |
| 11.207047395333332 | 24.64 |
| 11.210108125972221 | 24.67 |
| 11.213176634805556 | 24.67 |
| 11.216236532055554 | 24.678 |
| 11.219305318694444 | 24.685 |
| 11.222368549444445 | 24.685 |
| 11.225431502416667 | 24.678 |
| 11.228496955527778 | 24.685 |
| 11.231600744166666 | 24.67 |
| 11.23466036361111 | 24.67 |
| 11.237723872166665 | 24.678 |
| 11.240787102916666 | 24.701 |
| 11.24385616736111 | 24.693 |
| 11.246915786805555 | 24.693 |
| 11.249975128444445 | 24.693 |
| 11.253038081416667 | 24.693 |
| 11.25610575688889 | 24.678 |
| 11.259170098805555 | 24.693 |
| 11.262250552777779 | 24.701 |
| 11.265312672361112 | 24.701 |
| 11.268389237222221 | 24.693 |
| 11.271454412555556 | 24.693 |
| 11.274519310083335 | 24.701 |
| 11.27761143138889 | 24.708 |
| 11.280674384333333 | 24.708 |
| 11.283759005222223 | 24.701 |
| 11.286818902472222 | 24.701 |
| 11.289884355583332 | 24.693 |
| 11.292947308527777 | 24.708 |
| 11.296018039722224 | 24.708 |
| 11.299087104166667 | 24.716 |
| 11.302148112583334 | 24.724 |
| 11.305219954944445 | 24.716 |
| 11.308280129972223 | 24.724 |
| 11.311339749416666 | 24.724 |
| 11.314406313694445 | 24.731 |
| 11.31746593313889 | 24.724 |
| 11.320528052722223 | 24.716 |
| 11.323605450972224 | 24.708 |
| 11.326664792638889 | 24.731 |
| 11.329724967666667 | 24.716 |
| 11.332786809444444 | 24.731 |
| 11.335849206833334 | 24.716 |
| 11.338911882 | 24.739 |
| 11.34197177925 | 24.731 |
| 11.345031676472223 | 24.731 |
| 11.348101574305556 | 24.708 |
| 11.351160915944444 | 24.739 |
| 11.35422109097222 | 24.731 |
| 11.357281543805556 | 24.724 |
| 11.36034116325 | 24.724 |
| 11.363457452611112 | 24.724 |
| 11.366523461305555 | 24.724 |
| 11.369584191916665 | 24.731 |
| 11.372645200333334 | 24.731 |
| 11.37570620875 | 24.731 |
| 11.378769995083335 | 24.731 |
| 11.38183017013889 | 24.739 |
| 11.38489173413889 | 24.731 |
| 11.387951075777778 | 24.746 |
| 11.39101402875 | 24.754 |
| 11.394073648194444 | 24.739 |
| 11.397173825500001 | 24.739 |
| 11.400238723027778 | 24.746 |
| 11.403300287027777 | 24.731 |
| 11.40636073986111 | 24.739 |
| 11.409427859722223 | 24.754 |
| 11.412491646083332 | 24.754 |
| 11.415556265805556 | 24.754 |
| 11.418618385416666 | 24.762 |
| 11.421686338666667 | 24.762 |
| 11.424750680583333 | 24.762 |
| 11.427811688999999 | 24.777 |
| 11.430872141833333 | 24.769 |
| 11.433934261416667 | 24.762 |
| 11.436999714527778 | 24.769 |
| 11.440061278527777 | 24.769 |
| 11.443121175777778 | 24.769 |
| 11.446182184194445 | 24.762 |
| 11.449245970527778 | 24.769 |
| 11.452310590277778 | 24.777 |
| 11.455373543222223 | 24.777 |
| 11.4584495525 | 24.785 |
| 11.461514450027778 | 24.792 |
| 11.464579625361111 | 24.785 |
| 11.467639244805556 | 24.785 |
| 11.470700253194446 | 24.792 |
| 11.473760706027777 | 24.792 |
| 11.476821714444444 | 24.8 |
| 11.479899112694444 | 24.792 |
| 11.482961787861111 | 24.785 |
| 11.486027240972222 | 24.792 |
| 11.489102139055555 | 24.792 |
| 11.49216231411111 | 24.808 |
| 11.495222211333335 | 24.8 |
| 11.49829683163889 | 24.83 |
| 11.501357006666666 | 24.808 |
| 11.50441995963889 | 24.823 |
| 11.507481801444444 | 24.83 |
| 11.510552254833332 | 24.83 |
| 11.513617430138888 | 24.846 |
| 11.516677327388889 | 24.83 |
| 11.519746947416667 | 24.846 |
| 11.522807678027778 | 24.853 |
| 11.525878687 | 24.853 |
| 11.528941084388888 | 24.861 |
| 11.53200014825 | 24.853 |
| 11.53506199002778 | 24.846 |
| 11.538124387416667 | 24.861 |
| 11.541184562444444 | 24.869 |
| 11.544245848666668 | 24.869 |
| 11.547306023694444 | 24.869 |
| 11.550365643138889 | 24.869 |
| 11.553424984777777 | 24.869 |
| 11.55648404863889 | 24.869 |
| 11.559544223666668 | 24.876 |
| 11.562606065472222 | 24.869 |
| 11.56566707388889 | 24.861 |
| 11.568728360083332 | 24.869 |
| 11.571791313055556 | 24.846 |
| 11.5748509325 | 24.853 |
| 11.577914441055556 | 24.853 |
| 11.580977671833335 | 24.853 |
| 11.584036735694445 | 24.838 |
| 11.587104966722222 | 24.846 |
| 11.590166252944444 | 24.838 |
| 11.593231428249998 | 24.846 |
| 11.596292436666667 | 24.861 |
| 11.599352333916666 | 24.846 |
| 11.602414453500002 | 24.846 |
| 11.60547685086111 | 24.861 |
| 11.608536192527778 | 24.869 |
| 11.611595534166668 | 24.853 |
| 11.614657375972222 | 24.869 |
| 11.617717550999998 | 24.853 |
| 11.620778559416667 | 24.869 |
| 11.623838456666666 | 24.876 |
| 11.626899187277777 | 24.861 |
| 11.629963529222223 | 24.846 |
| 11.633024259833334 | 24.853 |
| 11.636084434861111 | 24.861 |
| 11.63915488825 | 24.861 |
| 11.642216730055557 | 24.861 |
| 11.645281905361111 | 24.869 |
| 11.648348469666667 | 24.853 |
| 11.651410311444446 | 24.861 |
| 11.654471597666666 | 24.861 |
| 11.657531772694444 | 24.869 |
| 11.660591114333332 | 24.884 |
| 11.663651567166667 | 24.861 |
| 11.666717020277778 | 24.884 |
| 11.669780251027777 | 24.876 |
| 11.672841815027779 | 24.899 |
| 11.675901156694444 | 24.899 |
| 11.678961609527779 | 24.907 |
| 11.682021228972221 | 24.907 |
| 11.685084459722223 | 24.907 |
| 11.688145468138888 | 24.914 |
| 11.691205365388889 | 24.914 |
| 11.694267207166668 | 24.914 |
| 11.697327937777779 | 24.945 |
| 11.700387279444444 | 24.945 |
| 11.703450788 | 24.93 |
| 11.706510407444444 | 24.937 |
| 11.709589472444444 | 24.937 |
| 11.712650480861111 | 24.96 |
| 11.715711211472222 | 24.96 |
| 11.718770553138889 | 24.952 |
| 11.72183045036111 | 24.952 |
| 11.724900348166665 | 24.96 |
| 11.727966079083334 | 24.952 |
| 11.731028476472222 | 24.975 |
| 11.734093373972222 | 24.968 |
| 11.737153826805557 | 24.983 |
| 11.740216779777779 | 24.96 |
| 11.74328223288889 | 24.968 |
| 11.746343519111111 | 24.975 |
| 11.74940369413889 | 24.983 |
| 11.752464146944444 | 24.975 |
| 11.755523210805556 | 24.983 |
| 11.758583941444446 | 24.975 |
| 11.761648838944444 | 24.983 |
| 11.76470818061111 | 24.998 |
| 11.76776835563889 | 24.998 |
| 11.770832419777777 | 24.991 |
| 11.77389287261111 | 25.013 |
| 11.776953881027778 | 24.998 |
| 11.780017389583334 | 25.013 |
| 11.78308089813889 | 25.021 |
| 11.786145517861112 | 25.006 |
| 11.789205137305556 | 25.029 |
| 11.792264756749999 | 25.036 |
| 11.795328265305555 | 25.044 |
| 11.798391496083333 | 25.044 |
| 11.801454726833333 | 25.075 |
| 11.80451573525 | 25.067 |
| 11.80757646586111 | 25.075 |
| 11.810636918694444 | 25.082 |
| 11.813700982833334 | 25.075 |
| 11.816761435666667 | 25.075 |
| 11.819825221999999 | 25.082 |
| 11.822893730861113 | 25.097 |
| 11.825953628083333 | 25.105 |
| 11.829016303277777 | 25.113 |
| 11.832077589472222 | 25.105 |
| 11.835138597888887 | 25.12 |
| 11.83820071747222 | 25.128 |
| 11.84126394825 | 25.143 |
| 11.844323845472223 | 25.143 |
| 11.847384576083334 | 25.151 |
| 11.85045280713889 | 25.143 |
| 11.853512148805557 | 25.166 |
| 11.856577601916667 | 25.189 |
| 11.859636943555556 | 25.189 |
| 11.862703785638889 | 25.204 |
| 11.865767016388888 | 25.197 |
| 11.868826358055555 | 25.227 |
| 11.8718940335 | 25.219 |
| 11.87495865325 | 25.227 |
| 11.878019106055557 | 25.235 |
| 11.881082059027777 | 25.25 |
| 11.884145845388888 | 25.25 |
| 11.887205187027778 | 25.265 |
| 11.890265362055555 | 25.273 |
| 11.893327481666667 | 25.265 |
| 11.896386823305555 | 25.281 |
| 11.899453109805554 | 25.296 |
| 11.902512451444444 | 25.303 |
| 11.905572626472221 | 25.296 |
| 11.908632523722222 | 25.288 |
| 11.911691865361112 | 25.296 |
| 11.914751207027779 | 25.296 |
| 11.91781499336111 | 25.296 |
| 11.920875168416666 | 25.311 |
| 11.92394145488889 | 25.296 |
| 11.927004407861112 | 25.303 |
| 11.930065138472223 | 25.334 |
| 11.933128091444445 | 25.319 |
| 11.936190211027778 | 25.326 |
| 11.939258164305556 | 25.334 |
| 11.942322228444443 | 25.349 |
| 11.945381292305555 | 25.357 |
| 11.948444800861111 | 25.357 |
| 11.951504698083333 | 25.38 |
| 11.954569595611112 | 25.395 |
| 11.957628937277779 | 25.403 |
| 11.960692445833335 | 25.403 |
| 11.963752065277777 | 25.403 |
| 11.966811684722222 | 25.448 |
| 11.969874082083333 | 25.456 |
| 11.972934534916666 | 25.441 |
| 11.975995543333333 | 25.456 |
| 11.979055162777778 | 25.471 |
| 11.982116726777777 | 25.464 |
| 11.985183291055556 | 25.464 |
| 11.988242632722223 | 25.479 |
| 11.991303085527777 | 25.494 |
| 11.994363260583333 | 25.494 |
| 11.997425380166666 | 25.494 |
| 12.000487777527779 | 25.502 |
| 12.003553508444444 | 25.525 |
| 12.006613961277779 | 25.517 |
| 12.00967941438889 | 25.517 |
| 12.01273931161111 | 25.54 |
| 12.015806153694443 | 25.54 |
| 12.018867717694443 | 25.548 |
| 12.021942893583333 | 25.578 |
| 12.025004179805556 | 25.563 |
| 12.028066577166667 | 25.578 |
| 12.031129530138887 | 25.578 |
| 12.034189427388888 | 25.586 |
| 12.037250713583333 | 25.593 |
| 12.040313110972221 | 25.609 |
| 12.043376897333333 | 25.593 |
| 12.046444294999999 | 25.601 |
| 12.04950502561111 | 25.609 |
| 12.052566867416667 | 25.593 |
| 12.055630653749999 | 25.593 |
| 12.058698329222223 | 25.609 |
| 12.061759059833333 | 25.609 |
| 12.06482479075 | 25.609 |
| 12.067885521361111 | 25.624 |
| 12.070947640944445 | 25.616 |
| 12.074015316416666 | 25.616 |
| 12.077076324833333 | 25.624 |
| 12.080142611305556 | 25.631 |
| 12.083205008694444 | 25.639 |
| 12.086268795055556 | 25.647 |
| 12.089332303611112 | 25.662 |
| 12.092403034805555 | 25.662 |
| 12.095462932027777 | 25.67 |
| 12.098522273694444 | 25.677 |
| 12.101583004305555 | 25.67 |
| 12.10464262375 | 25.692 |
| 12.10770835463889 | 25.715 |
| 12.110769085277779 | 25.7 |
| 12.113851483805556 | 25.7 |
| 12.116910825444446 | 25.692 |
| 12.119976000777777 | 25.692 |
| 12.123040620500001 | 25.692 |
| 12.126106629194446 | 25.7 |
| 12.129166804222223 | 25.708 |
| 12.132227812638888 | 25.715 |
| 12.13528854325 | 25.708 |
| 12.138352885194443 | 25.708 |
| 12.14142111625 | 25.715 |
| 12.144480180111112 | 25.723 |
| 12.14754174411111 | 25.731 |
| 12.150611641916667 | 25.738 |
| 12.15367709502778 | 25.746 |
| 12.156736436666666 | 25.731 |
| 12.15979911186111 | 25.738 |
| 12.162859842472221 | 25.723 |
| 12.165924462194445 | 25.746 |
| 12.169000749277778 | 25.738 |
| 12.172062313277777 | 25.746 |
| 12.175128877555556 | 25.754 |
| 12.178190441555556 | 25.784 |
| 12.181253116722223 | 25.761 |
| 12.18431245838889 | 25.776 |
| 12.187371800027776 | 25.776 |
| 12.190433641833334 | 25.792 |
| 12.193499094944444 | 25.776 |
| 12.196569548333333 | 25.776 |
| 12.199631945722222 | 25.799 |
| 12.202691565166667 | 25.792 |
| 12.205755629305555 | 25.799 |
| 12.208816359916666 | 25.799 |
| 12.211890980222222 | 25.799 |
| 12.214952822027778 | 25.815 |
| 12.218019386305556 | 25.807 |
| 12.221085395 | 25.807 |
| 12.224149459138888 | 25.815 |
| 12.227211300944445 | 25.815 |
| 12.230272031555556 | 25.822 |
| 12.233332206583333 | 25.815 |
| 12.236393215 | 25.815 |
| 12.239457001361112 | 25.807 |
| 12.242518287555557 | 25.822 |
| 12.245578740388888 | 25.807 |
| 12.248638082027778 | 25.822 |
| 12.251698257055555 | 25.815 |
| 12.254763710194444 | 25.837 |
| 12.257823607416666 | 25.83 |
| 12.260883226861111 | 25.815 |
| 12.263947568805555 | 25.822 |
| 12.267009966194445 | 25.83 |
| 12.270069863416667 | 25.837 |
| 12.273131983 | 25.845 |
| 12.276192991416666 | 25.853 |
| 12.27925427763889 | 25.853 |
| 12.28231750838889 | 25.853 |
| 12.285379072388888 | 25.868 |
| 12.288438414027777 | 25.876 |
| 12.291512200972223 | 25.868 |
| 12.294572376 | 25.876 |
| 12.297643662777777 | 25.853 |
| 12.300702726638889 | 25.883 |
| 12.303762346083333 | 25.876 |
| 12.306822243305556 | 25.876 |
| 12.309883251722221 | 25.891 |
| 12.31294259338889 | 25.883 |
| 12.316020269416667 | 25.898 |
| 12.319080444444444 | 25.898 |
| 12.322140619472222 | 25.891 |
| 12.325202183472223 | 25.914 |
| 12.32826541425 | 25.898 |
| 12.331325311472222 | 25.906 |
| 12.334386319888889 | 25.914 |
| 12.337450661833333 | 25.921 |
| 12.34051167025 | 25.929 |
| 12.343580179083332 | 25.921 |
| 12.346642298666666 | 25.944 |
| 12.34970830736111 | 25.937 |
| 12.352767649027777 | 25.937 |
| 12.35583226875 | 25.921 |
| 12.358892999361112 | 25.937 |
| 12.361953452194443 | 25.967 |
| 12.365013349444444 | 25.944 |
| 12.368073246666667 | 25.944 |
| 12.371133421694445 | 25.96 |
| 12.3742033195 | 25.944 |
| 12.377265161305555 | 25.952 |
| 12.380325058555556 | 25.952 |
| 12.383392734000001 | 25.944 |
| 12.386457631527778 | 25.952 |
| 12.389517250972222 | 25.952 |
| 12.392585759805556 | 25.96 |
| 12.395647323805555 | 25.952 |
| 12.398708054444445 | 25.944 |
| 12.401769618444444 | 25.952 |
| 12.404835904916666 | 25.952 |
| 12.407904413777779 | 25.944 |
| 12.410966811166666 | 25.967 |
| 12.414026430611111 | 25.944 |
| 12.417086883416667 | 25.952 |
| 12.42014733625 | 25.937 |
| 12.423210011416666 | 25.952 |
| 12.426269353083333 | 25.952 |
| 12.429334528388889 | 25.944 |
| 12.432394981222222 | 25.952 |
| 12.43545904536111 | 25.96 |
| 12.438519498194445 | 25.937 |
| 12.441579395416667 | 25.952 |
| 12.44464457075 | 25.952 |
| 12.447728080444445 | 25.952 |
| 12.450791033416667 | 25.944 |
| 12.453857597694446 | 25.967 |
| 12.45693471813889 | 25.96 |
| 12.4599985045 | 25.952 |
| 12.46306645775 | 25.967 |
| 12.466129410722221 | 25.967 |
| 12.469192085888888 | 25.967 |
| 12.472254761055556 | 25.967 |
| 12.475326603444444 | 25.975 |
| 12.478389556416666 | 25.952 |
| 12.481451398194444 | 25.967 |
| 12.48451324 | 25.967 |
| 12.487575637361111 | 25.967 |
| 12.490642479444444 | 25.967 |
| 12.493703487861112 | 25.975 |
| 12.496767829805556 | 25.96 |
| 12.499837172027778 | 25.967 |
| 12.502896513666666 | 25.967 |
| 12.505956688722222 | 25.982 |
| 12.509017141527778 | 25.982 |
| 12.512087872722223 | 25.975 |
| 12.515147492166667 | 25.982 |
| 12.51821183411111 | 25.99 |
| 12.521271731333332 | 26.005 |
| 12.524331073 | 26.013 |
| 12.527390414638889 | 26.021 |
| 12.530451978638888 | 26.036 |
| 12.533512431472223 | 26.028 |
| 12.536572050916666 | 26.036 |
| 12.53963333711111 | 26.036 |
| 12.5426957345 | 26.036 |
| 12.545757854083334 | 26.066 |
| 12.548818306916667 | 26.043 |
| 12.551878481944446 | 26.043 |
| 12.554937823611112 | 26.043 |
| 12.557997443055555 | 26.074 |
| 12.56105734027778 | 26.051 |
| 12.56411779311111 | 26.043 |
| 12.567177412555555 | 26.066 |
| 12.570237032 | 26.051 |
| 12.57329637363889 | 26.074 |
| 12.576358215444444 | 26.059 |
| 12.579418390472222 | 26.074 |
| 12.582483287999999 | 26.066 |
| 12.585550685666666 | 26.066 |
| 12.588610027333333 | 26.066 |
| 12.591674647055555 | 26.074 |
| 12.5947342665 | 26.074 |
| 12.597797497250001 | 26.082 |
| 12.600857672277778 | 26.097 |
| 12.603918125111113 | 26.104 |
| 12.60697830013889 | 26.112 |
| 12.610047920166668 | 26.127 |
| 12.613109206361113 | 26.12 |
| 12.616168548027778 | 26.143 |
| 12.619240112583332 | 26.143 |
| 12.622300843222222 | 26.158 |
| 12.625362685 | 26.158 |
| 12.628425637972223 | 26.143 |
| 12.631484701833333 | 26.158 |
| 12.634547932583333 | 26.181 |
| 12.637607552027779 | 26.181 |
| 12.640668838249999 | 26.196 |
| 12.64373040225 | 26.204 |
| 12.646794744194445 | 26.204 |
| 12.649862141861112 | 26.234 |
| 12.652929817305555 | 26.227 |
| 12.655991936888888 | 26.249 |
| 12.659052389722222 | 26.257 |
| 12.662112842555556 | 26.257 |
| 12.665172184194445 | 26.257 |
| 12.668232359222221 | 26.257 |
| 12.671292534277777 | 26.265 |
| 12.674351875916667 | 26.272 |
| 12.677417051222223 | 26.265 |
| 12.680485282277779 | 26.28 |
| 12.683551290972222 | 26.265 |
| 12.686613132777778 | 26.272 |
| 12.689680252638889 | 26.265 |
| 12.692739872083333 | 26.28 |
| 12.695805603 | 26.28 |
| 12.698866333611111 | 26.288 |
| 12.701934286861112 | 26.295 |
| 12.704997795444445 | 26.303 |
| 12.70805824825 | 26.31 |
| 12.711117312111112 | 26.31 |
| 12.714185543166668 | 26.318 |
| 12.717246829361113 | 26.31 |
| 12.720308393361112 | 26.318 |
| 12.723371346333334 | 26.303 |
| 12.726431799166665 | 26.288 |
| 12.729491418611111 | 26.31 |
| 12.732552427027777 | 26.318 |
| 12.735612046472221 | 26.31 |
| 12.738682777666666 | 26.31 |
| 12.741745452833333 | 26.326 |
| 12.744805072277778 | 26.303 |
| 12.747865802888889 | 26.326 |
| 12.750926255722222 | 26.31 |
| 12.753986152972221 | 26.333 |
| 12.75707521852778 | 26.318 |
| 12.760135115777777 | 26.31 |
| 12.7631997355 | 26.295 |
| 12.76627630036111 | 26.318 |
| 12.769337864361113 | 26.326 |
| 12.77239803938889 | 26.318 |
| 12.775457381055556 | 26.333 |
| 12.77851783386111 | 26.333 |
| 12.781586064916667 | 26.341 |
| 12.784645962166667 | 26.349 |
| 12.7877097485 | 26.372 |
| 12.79077770175 | 26.372 |
| 12.793842877083334 | 26.349 |
| 12.796913330472222 | 26.364 |
| 12.799978505805555 | 26.379 |
| 12.803046459055555 | 26.372 |
| 12.8061141345 | 26.364 |
| 12.809183198944446 | 26.372 |
| 12.812258374833334 | 26.387 |
| 12.815318272055556 | 26.387 |
| 12.818379558277776 | 26.379 |
| 12.8214394555 | 26.387 |
| 12.824510186694445 | 26.379 |
| 12.827569528361112 | 26.387 |
| 12.830630814555557 | 26.387 |
| 12.833694323111112 | 26.387 |
| 12.83675366477778 | 26.394 |
| 12.839814117583334 | 26.402 |
| 12.842877070555554 | 26.387 |
| 12.845946968361112 | 26.387 |
| 12.849011032527779 | 26.394 |
| 12.852072874305554 | 26.402 |
| 12.855138605222223 | 26.387 |
| 12.858199058055556 | 26.402 |
| 12.861260066444444 | 26.394 |
| 12.86431940811111 | 26.394 |
| 12.867383194444445 | 26.394 |
| 12.870444480666666 | 26.394 |
| 12.873510211555555 | 26.402 |
| 12.876573164527777 | 26.402 |
| 12.879632506194444 | 26.387 |
| 12.882698514888888 | 26.394 |
| 12.885776468722222 | 26.387 |
| 12.88883581036111 | 26.387 |
| 12.8918998745 | 26.387 |
| 12.894961994083333 | 26.387 |
| 12.898023280305555 | 26.372 |
| 12.901112623666666 | 26.372 |
| 12.904182799277777 | 26.372 |
| 12.907247418999999 | 26.372 |
| 12.910308149611112 | 26.364 |
| 12.913375547277777 | 26.356 |
| 12.916438222472223 | 26.379 |
| 12.919503397777778 | 26.379 |
| 12.922564684 | 26.356 |
| 12.925625136805557 | 26.349 |
| 12.928698368138889 | 26.372 |
| 12.931761043333333 | 26.349 |
| 12.93482455188889 | 26.356 |
| 12.937885004694445 | 26.349 |
| 12.940946290916667 | 26.349 |
| 12.944008966083333 | 26.349 |
| 12.947069141111111 | 26.333 |
| 12.950134316444444 | 26.349 |
| 12.953195047055557 | 26.341 |
| 12.956269667361111 | 26.349 |
| 12.959354288222222 | 26.349 |
| 12.96241529663889 | 26.356 |
| 12.965478527416668 | 26.356 |
| 12.968543147138888 | 26.379 |
| 12.971606100111112 | 26.364 |
| 12.974665719555556 | 26.379 |
| 12.97773561736111 | 26.364 |
| 12.980794959027778 | 26.372 |
| 12.983855134055554 | 26.394 |
| 12.986921698333333 | 26.379 |
| 12.989981317777778 | 26.387 |
| 12.993046770888888 | 26.379 |
| 12.996115835305556 | 26.402 |
| 12.999187955472221 | 26.402 |
| 13.002248408305556 | 26.379 |
| 13.00532302861111 | 26.402 |
| 13.008382648055557 | 26.41 |
| 13.011443378666668 | 26.402 |
| 13.014510776333335 | 26.41 |
| 13.017577896222223 | 26.417 |
| 13.020640015805556 | 26.425 |
| 13.023711858166665 | 26.433 |
| 13.026781478194444 | 26.448 |
| 13.02984109763889 | 26.448 |
| 13.032902939416665 | 26.448 |
| 13.03597144825 | 26.455 |
| 13.039031623305556 | 26.471 |
| 13.04209374288889 | 26.471 |
| 13.045153640111112 | 26.471 |
| 13.048247705972221 | 26.471 |
| 13.051307603222222 | 26.478 |
| 13.05436777825 | 26.478 |
| 13.057432953555557 | 26.471 |
| 13.060492850805556 | 26.471 |
| 13.063554137 | 26.471 |
| 13.06663153525 | 26.478 |
| 13.069701155277778 | 26.494 |
| 13.072767719555555 | 26.471 |
| 13.075828172388889 | 26.478 |
| 13.078889180805556 | 26.478 |
| 13.08195213375 | 26.478 |
| 13.085012308805556 | 26.486 |
| 13.088071372666667 | 26.494 |
| 13.091142937222221 | 26.501 |
| 13.094202834472222 | 26.501 |
| 13.09727023213889 | 26.494 |
| 13.100358464333333 | 26.501 |
| 13.103422250666666 | 26.478 |
| 13.106488259361111 | 26.509 |
| 13.109553712472223 | 26.509 |
| 13.112619165583334 | 26.509 |
| 13.115685174305556 | 26.501 |
| 13.118744515944444 | 26.524 |
| 13.121806635527777 | 26.524 |
| 13.12486792175 | 26.524 |
| 13.127934208222221 | 26.509 |
| 13.13102355161111 | 26.524 |
| 13.13408456 | 26.532 |
| 13.137157235750001 | 26.532 |
| 13.140222966666666 | 26.532 |
| 13.143289253166667 | 26.539 |
| 13.146356650833333 | 26.516 |
| 13.149426270833333 | 26.509 |
| 13.152516725388889 | 26.524 |
| 13.155577733805554 | 26.532 |
| 13.158640131166667 | 26.532 |
| 13.16170141738889 | 26.524 |
| 13.164763259166666 | 26.532 |
| 13.167832323611112 | 26.509 |
| 13.170894721 | 26.532 |
| 13.173966841138888 | 26.539 |
| 13.177036183361112 | 26.539 |
| 13.18009858075 | 26.562 |
| 13.183160422555554 | 26.539 |
| 13.186220319777778 | 26.562 |
| 13.189282717166668 | 26.57 |
| 13.19234400336111 | 26.57 |
| 13.195404178416666 | 26.562 |
| 13.198465742416667 | 26.57 |
| 13.20152952875 | 26.57 |
| 13.20459025936111 | 26.593 |
| 13.207676547 | 26.585 |
| 13.210741166750001 | 26.593 |
| 13.21382578761111 | 26.593 |
| 13.216886240444445 | 26.593 |
| 13.219948915611111 | 26.608 |
| 13.223010479611112 | 26.6 |
| 13.226071210250002 | 26.608 |
| 13.229135274388888 | 26.608 |
| 13.232197949555555 | 26.616 |
| 13.235260346944445 | 26.623 |
| 13.238320244166665 | 26.608 |
| 13.241380419194446 | 26.623 |
| 13.244440316444443 | 26.616 |
| 13.247502436027776 | 26.608 |
| 13.250571222666666 | 26.631 |
| 13.253633620055556 | 26.623 |
| 13.256698239777776 | 26.623 |
| 13.259757581444445 | 26.631 |
| 13.262817200888888 | 26.623 |
| 13.265876264722221 | 26.623 |
| 13.268936717555555 | 26.623 |
| 13.271996059222221 | 26.631 |
| 13.275059012166668 | 26.631 |
| 13.278122242944445 | 26.623 |
| 13.281187696055555 | 26.623 |
| 13.284247315499998 | 26.623 |
| 13.287307490527779 | 26.639 |
| 13.290369887916667 | 26.631 |
| 13.293430896333332 | 26.631 |
| 13.29649607163889 | 26.616 |
| 13.29957096975 | 26.631 |
| 13.302638922999998 | 26.646 |
| 13.305698264638888 | 26.639 |
| 13.308760939805556 | 26.639 |
| 13.311822781611111 | 26.631 |
| 13.31489240163889 | 26.631 |
| 13.317954243416667 | 26.623 |
| 13.321016918611111 | 26.623 |
| 13.324080982749999 | 26.631 |
| 13.327142546749998 | 26.631 |
| 13.330201888388888 | 26.631 |
| 13.333268452666667 | 26.623 |
| 13.336328349916668 | 26.608 |
| 13.33938796936111 | 26.623 |
| 13.342448699972222 | 26.616 |
| 13.345513875305555 | 26.623 |
| 13.348574883722224 | 26.631 |
| 13.351636169916668 | 26.623 |
| 13.354698567305556 | 26.623 |
| 13.357759297916667 | 26.616 |
| 13.360818917361112 | 26.623 |
| 13.363882703722224 | 26.623 |
| 13.366942045361112 | 26.608 |
| 13.370001387027777 | 26.608 |
| 13.373061839833333 | 26.608 |
| 13.376123126055557 | 26.616 |
| 13.379185523416666 | 26.6 |
| 13.382244587277778 | 26.585 |
| 13.385309762611111 | 26.608 |
| 13.388371882194445 | 26.6 |
| 13.39143316838889 | 26.6 |
| 13.394492510055557 | 26.616 |
| 13.397554074055556 | 26.608 |
| 13.40061536025 | 26.593 |
| 13.40367609088889 | 26.608 |
| 13.406735154722222 | 26.623 |
| 13.409795607555557 | 26.616 |
| 13.412858282722222 | 26.608 |
| 13.415918457777778 | 26.631 |
| 13.418981410722223 | 26.623 |
| 13.422041030166666 | 26.623 |
| 13.42510231638889 | 26.631 |
| 13.4281677695 | 26.623 |
| 13.43122711113889 | 26.631 |
| 13.434288397361112 | 26.623 |
| 13.437348016805556 | 26.608 |
| 13.440407358444444 | 26.616 |
| 13.443469478027778 | 26.608 |
| 13.446532153222224 | 26.623 |
| 13.449592050444444 | 26.593 |
| 13.452653336666666 | 26.6 |
| 13.455713789472224 | 26.593 |
| 13.458775075694444 | 26.608 |
| 13.461848029222221 | 26.6 |
| 13.464915426888888 | 26.6 |
| 13.467974768555555 | 26.6 |
| 13.47103855488889 | 26.6 |
| 13.474098174333333 | 26.6 |
| 13.47715918275 | 26.6 |
| 13.480225747055556 | 26.578 |
| 13.483289255611112 | 26.585 |
| 13.486349708416666 | 26.585 |
| 13.48941266138889 | 26.578 |
| 13.492480336861112 | 26.578 |
| 13.495552179222221 | 26.57 |
| 13.498614576611113 | 26.578 |
| 13.501680585305557 | 26.555 |
| 13.504741593722223 | 26.562 |
| 13.507813436083334 | 26.562 |
| 13.51087361111111 | 26.539 |
| 13.513933230555557 | 26.562 |
| 13.516993127805554 | 26.539 |
| 13.5200591365 | 26.539 |
| 13.52312208947222 | 26.532 |
| 13.526182820083333 | 26.524 |
| 13.529242995111112 | 26.532 |
| 13.5323053925 | 26.555 |
| 13.535365845333333 | 26.532 |
| 13.538425464777779 | 26.532 |
| 13.541491195666666 | 26.539 |
| 13.544552204083333 | 26.532 |
| 13.547626824388889 | 26.524 |
| 13.55068588825 | 26.509 |
| 13.55374745225 | 26.516 |
| 13.556818461222223 | 26.516 |
| 13.559883080972224 | 26.532 |
| 13.562944922749999 | 26.524 |
| 13.566004542194444 | 26.539 |
| 13.569066106194445 | 26.547 |
| 13.572126281222223 | 26.532 |
| 13.575187011861113 | 26.547 |
| 13.578246631305555 | 26.539 |
| 13.581314584555557 | 26.532 |
| 13.584387815888888 | 26.532 |
| 13.587449102083333 | 26.524 |
| 13.59050844375 | 26.524 |
| 13.593587786527777 | 26.532 |
| 13.596649350527779 | 26.555 |
| 13.599710081166666 | 26.524 |
| 13.602769422805554 | 26.532 |
| 13.605829597833333 | 26.524 |
| 13.608893384194445 | 26.524 |
| 13.611953281416667 | 26.555 |
| 13.615016512194444 | 26.547 |
| 13.618088076749999 | 26.532 |
| 13.621151029722222 | 26.532 |
| 13.624217316222223 | 26.547 |
| 13.627287214027778 | 26.524 |
| 13.630349889222222 | 26.532 |
| 13.633410342027778 | 26.532 |
| 13.636471072666668 | 26.547 |
| 13.63953402561111 | 26.57 |
| 13.642595867416667 | 26.555 |
| 13.645682710638889 | 26.555 |
| 13.648744274638888 | 26.562 |
| 13.651809172166665 | 26.555 |
| 13.65487045836111 | 26.555 |
| 13.657930633416667 | 26.585 |
| 13.660991364027778 | 26.578 |
| 13.664054594777777 | 26.578 |
| 13.667114214222222 | 26.578 |
| 13.67017827836111 | 26.57 |
| 13.673240953555556 | 26.562 |
| 13.676300850777778 | 26.57 |
| 13.679361859194444 | 26.562 |
| 13.682421478638888 | 26.562 |
| 13.6854805425 | 26.555 |
| 13.688540717527777 | 26.555 |
| 13.6916036705 | 26.547 |
| 13.694666901277778 | 26.547 |
| 13.697739854805556 | 26.555 |
| 13.700800307638888 | 26.562 |
| 13.703861316055557 | 26.562 |
| 13.706927046944445 | 26.555 |
| 13.709988610944444 | 26.562 |
| 13.713054897444444 | 26.562 |
| 13.71611590586111 | 26.57 |
| 13.719177192055556 | 26.57 |
| 13.722242922972223 | 26.593 |
| 13.725304486972222 | 26.57 |
| 13.728366606555555 | 26.562 |
| 13.731426503805556 | 26.57 |
| 13.734485845444445 | 26.57 |
| 13.737548798416666 | 26.578 |
| 13.740613695944445 | 26.57 |
| 13.74367498213889 | 26.562 |
| 13.746736546138889 | 26.562 |
| 13.749796165583332 | 26.562 |
| 13.752859396361112 | 26.555 |
| 13.755923738277778 | 26.562 |
| 13.758993913888888 | 26.57 |
| 13.76205686686111 | 26.57 |
| 13.765118430861111 | 26.57 |
| 13.768181661638888 | 26.57 |
| 13.771242947833333 | 26.562 |
| 13.774304511833332 | 26.555 |
| 13.777367742583333 | 26.57 |
| 13.780433195694444 | 26.547 |
| 13.783495315305556 | 26.555 |
| 13.786555490333333 | 26.547 |
| 13.789617332111112 | 26.555 |
| 13.79267750713889 | 26.555 |
| 13.795742682472222 | 26.555 |
| 13.798807302194444 | 26.532 |
| 13.801866643861112 | 26.532 |
| 13.8049259855 | 26.539 |
| 13.807987271722222 | 26.524 |
| 13.811050780277776 | 26.524 |
| 13.81411234427778 | 26.532 |
| 13.817175019444445 | 26.539 |
| 13.820235194472223 | 26.516 |
| 13.823296480666666 | 26.509 |
| 13.826358044666668 | 26.509 |
| 13.829421553222224 | 26.509 |
| 13.832482561638889 | 26.509 |
| 13.835545236833333 | 26.486 |
| 13.838605967444446 | 26.494 |